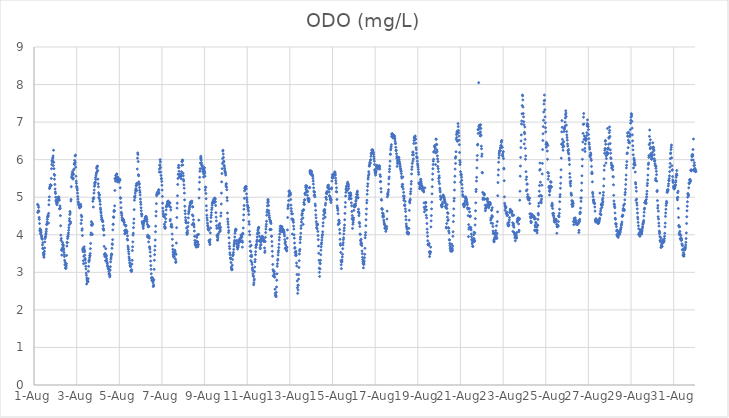
| Category | ODO (mg/L) |
|---|---|
| 44774.166666666664 | 4.81 |
| 44774.177083333336 | 4.6 |
| 44774.1875 | 4.6 |
| 44774.197916666664 | 4.78 |
| 44774.208333333336 | 4.64 |
| 44774.21875 | 4.73 |
| 44774.229166666664 | 4.63 |
| 44774.239583333336 | 4.46 |
| 44774.25 | 4.41 |
| 44774.260416666664 | 4.3 |
| 44774.270833333336 | 4.11 |
| 44774.28125 | 4.16 |
| 44774.291666666664 | 4.12 |
| 44774.302083333336 | 4.03 |
| 44774.3125 | 4.09 |
| 44774.322916666664 | 4.12 |
| 44774.333333333336 | 4.06 |
| 44774.34375 | 3.99 |
| 44774.354166666664 | 3.96 |
| 44774.364583333336 | 3.92 |
| 44774.375 | 3.9 |
| 44774.385416666664 | 3.88 |
| 44774.395833333336 | 3.73 |
| 44774.40625 | 3.64 |
| 44774.416666666664 | 3.79 |
| 44774.427083333336 | 3.63 |
| 44774.4375 | 3.52 |
| 44774.447916666664 | 3.47 |
| 44774.458333333336 | 3.44 |
| 44774.46875 | 3.4 |
| 44774.479166666664 | 3.49 |
| 44774.489583333336 | 3.56 |
| 44774.5 | 3.65 |
| 44774.510416666664 | 3.81 |
| 44774.520833333336 | 3.9 |
| 44774.53125 | 3.94 |
| 44774.541666666664 | 3.95 |
| 44774.552083333336 | 4 |
| 44774.5625 | 4.04 |
| 44774.572916666664 | 4.09 |
| 44774.583333333336 | 4.15 |
| 44774.59375 | 4.27 |
| 44774.604166666664 | 4.29 |
| 44774.614583333336 | 4.34 |
| 44774.625 | 4.41 |
| 44774.635416666664 | 4.47 |
| 44774.645833333336 | 4.48 |
| 44774.65625 | 4.52 |
| 44774.666666666664 | 4.5 |
| 44774.677083333336 | 4.31 |
| 44774.6875 | 4.57 |
| 44774.697916666664 | 4.8 |
| 44774.708333333336 | 4.92 |
| 44774.71875 | 5.01 |
| 44774.729166666664 | 5.23 |
| 44774.739583333336 | 5.25 |
| 44774.75 | 5.28 |
| 44774.760416666664 | 5.33 |
| 44774.770833333336 | 5.32 |
| 44774.78125 | 5.31 |
| 44774.791666666664 | 5.32 |
| 44774.802083333336 | 5.32 |
| 44774.8125 | 5.5 |
| 44774.822916666664 | 5.76 |
| 44774.833333333336 | 5.87 |
| 44774.84375 | 5.97 |
| 44774.854166666664 | 5.94 |
| 44774.864583333336 | 5.98 |
| 44774.875 | 6.03 |
| 44774.885416666664 | 6.06 |
| 44774.895833333336 | 6.1 |
| 44774.90625 | 5.84 |
| 44774.916666666664 | 6.25 |
| 44774.927083333336 | 5.93 |
| 44774.9375 | 5.76 |
| 44774.947916666664 | 5.61 |
| 44774.958333333336 | 5.48 |
| 44774.96875 | 5.58 |
| 44774.979166666664 | 5.34 |
| 44774.989583333336 | 5.22 |
| 44775.0 | 5.14 |
| 44775.010416666664 | 5.1 |
| 44775.020833333336 | 5 |
| 44775.03125 | 4.92 |
| 44775.041666666664 | 4.89 |
| 44775.052083333336 | 4.89 |
| 44775.0625 | 4.84 |
| 44775.072916666664 | 4.8 |
| 44775.083333333336 | 4.84 |
| 44775.09375 | 4.86 |
| 44775.104166666664 | 4.9 |
| 44775.114583333336 | 4.97 |
| 44775.125 | 4.95 |
| 44775.135416666664 | 4.94 |
| 44775.145833333336 | 4.99 |
| 44775.15625 | 5.01 |
| 44775.166666666664 | 5 |
| 44775.177083333336 | 4.95 |
| 44775.1875 | 4.92 |
| 44775.197916666664 | 4.69 |
| 44775.208333333336 | 4.7 |
| 44775.21875 | 4.77 |
| 44775.229166666664 | 4.71 |
| 44775.239583333336 | 4.51 |
| 44775.25 | 4.24 |
| 44775.260416666664 | 3.99 |
| 44775.270833333336 | 3.85 |
| 44775.28125 | 3.9 |
| 44775.291666666664 | 3.6 |
| 44775.302083333336 | 3.46 |
| 44775.3125 | 3.58 |
| 44775.322916666664 | 3.64 |
| 44775.333333333336 | 3.8 |
| 44775.34375 | 3.74 |
| 44775.354166666664 | 3.74 |
| 44775.364583333336 | 3.7 |
| 44775.375 | 3.72 |
| 44775.385416666664 | 3.64 |
| 44775.395833333336 | 3.6 |
| 44775.40625 | 3.53 |
| 44775.416666666664 | 3.47 |
| 44775.427083333336 | 3.42 |
| 44775.4375 | 3.32 |
| 44775.447916666664 | 3.2 |
| 44775.458333333336 | 3.27 |
| 44775.46875 | 3.2 |
| 44775.479166666664 | 3.12 |
| 44775.489583333336 | 3.1 |
| 44775.5 | 3.12 |
| 44775.510416666664 | 3.17 |
| 44775.520833333336 | 3.23 |
| 44775.53125 | 3.45 |
| 44775.541666666664 | 3.7 |
| 44775.552083333336 | 3.8 |
| 44775.5625 | 3.79 |
| 44775.572916666664 | 3.9 |
| 44775.583333333336 | 3.95 |
| 44775.59375 | 3.96 |
| 44775.604166666664 | 4 |
| 44775.614583333336 | 4.05 |
| 44775.625 | 4.12 |
| 44775.635416666664 | 4.19 |
| 44775.645833333336 | 4.26 |
| 44775.65625 | 4.37 |
| 44775.666666666664 | 4.43 |
| 44775.677083333336 | 4.54 |
| 44775.6875 | 4.62 |
| 44775.697916666664 | 4.58 |
| 44775.708333333336 | 4.3 |
| 44775.71875 | 4.34 |
| 44775.729166666664 | 4.9 |
| 44775.739583333336 | 4.94 |
| 44775.75 | 5.28 |
| 44775.760416666664 | 5.53 |
| 44775.770833333336 | 5.53 |
| 44775.78125 | 5.62 |
| 44775.791666666664 | 5.58 |
| 44775.802083333336 | 5.68 |
| 44775.8125 | 5.49 |
| 44775.822916666664 | 5.64 |
| 44775.833333333336 | 5.51 |
| 44775.84375 | 5.49 |
| 44775.854166666664 | 5.61 |
| 44775.864583333336 | 5.73 |
| 44775.875 | 5.75 |
| 44775.885416666664 | 5.88 |
| 44775.895833333336 | 5.9 |
| 44775.90625 | 5.98 |
| 44775.916666666664 | 5.87 |
| 44775.927083333336 | 6.1 |
| 44775.9375 | 5.93 |
| 44775.947916666664 | 6.12 |
| 44775.958333333336 | 5.8 |
| 44775.96875 | 5.56 |
| 44775.979166666664 | 5.43 |
| 44775.989583333336 | 5.37 |
| 44776.0 | 5.29 |
| 44776.010416666664 | 5.26 |
| 44776.020833333336 | 5.23 |
| 44776.03125 | 5.19 |
| 44776.041666666664 | 5.11 |
| 44776.052083333336 | 5.02 |
| 44776.0625 | 4.95 |
| 44776.072916666664 | 4.88 |
| 44776.083333333336 | 4.85 |
| 44776.09375 | 4.81 |
| 44776.104166666664 | 4.8 |
| 44776.114583333336 | 4.78 |
| 44776.125 | 4.74 |
| 44776.135416666664 | 4.72 |
| 44776.145833333336 | 4.72 |
| 44776.15625 | 4.73 |
| 44776.166666666664 | 4.76 |
| 44776.177083333336 | 4.78 |
| 44776.1875 | 4.81 |
| 44776.197916666664 | 4.75 |
| 44776.208333333336 | 4.3 |
| 44776.21875 | 4.52 |
| 44776.229166666664 | 4.39 |
| 44776.239583333336 | 4.48 |
| 44776.25 | 4.12 |
| 44776.260416666664 | 4.16 |
| 44776.270833333336 | 3.98 |
| 44776.28125 | 3.6 |
| 44776.291666666664 | 3.64 |
| 44776.302083333336 | 3.55 |
| 44776.3125 | 3.31 |
| 44776.322916666664 | 3.23 |
| 44776.333333333336 | 3.43 |
| 44776.34375 | 3.63 |
| 44776.354166666664 | 3.68 |
| 44776.364583333336 | 3.59 |
| 44776.375 | 3.55 |
| 44776.385416666664 | 3.46 |
| 44776.395833333336 | 3.37 |
| 44776.40625 | 3.33 |
| 44776.416666666664 | 3.25 |
| 44776.427083333336 | 3.16 |
| 44776.4375 | 3.09 |
| 44776.447916666664 | 2.98 |
| 44776.458333333336 | 2.92 |
| 44776.46875 | 2.69 |
| 44776.479166666664 | 2.85 |
| 44776.489583333336 | 2.81 |
| 44776.5 | 2.78 |
| 44776.510416666664 | 2.75 |
| 44776.520833333336 | 2.75 |
| 44776.53125 | 2.75 |
| 44776.541666666664 | 2.83 |
| 44776.552083333336 | 3.03 |
| 44776.5625 | 3.16 |
| 44776.572916666664 | 3.28 |
| 44776.583333333336 | 3.31 |
| 44776.59375 | 3.33 |
| 44776.604166666664 | 3.39 |
| 44776.614583333336 | 3.45 |
| 44776.625 | 3.44 |
| 44776.635416666664 | 3.5 |
| 44776.645833333336 | 3.63 |
| 44776.65625 | 3.77 |
| 44776.666666666664 | 4 |
| 44776.677083333336 | 4.05 |
| 44776.6875 | 4.35 |
| 44776.697916666664 | 4.26 |
| 44776.708333333336 | 4.28 |
| 44776.71875 | 4.25 |
| 44776.729166666664 | 4.31 |
| 44776.739583333336 | 4.01 |
| 44776.75 | 4.28 |
| 44776.760416666664 | 4.89 |
| 44776.770833333336 | 4.96 |
| 44776.78125 | 4.74 |
| 44776.791666666664 | 4.96 |
| 44776.802083333336 | 4.99 |
| 44776.8125 | 5.11 |
| 44776.822916666664 | 5.19 |
| 44776.833333333336 | 5.29 |
| 44776.84375 | 5.38 |
| 44776.854166666664 | 5.33 |
| 44776.864583333336 | 5.39 |
| 44776.875 | 5.4 |
| 44776.885416666664 | 5.52 |
| 44776.895833333336 | 5.47 |
| 44776.90625 | 5.57 |
| 44776.916666666664 | 5.62 |
| 44776.927083333336 | 5.65 |
| 44776.9375 | 5.77 |
| 44776.947916666664 | 5.8 |
| 44776.958333333336 | 5.81 |
| 44776.96875 | 5.69 |
| 44776.979166666664 | 5.83 |
| 44776.989583333336 | 5.71 |
| 44777.0 | 5.48 |
| 44777.010416666664 | 5.36 |
| 44777.020833333336 | 5.28 |
| 44777.03125 | 5.12 |
| 44777.041666666664 | 4.99 |
| 44777.052083333336 | 4.98 |
| 44777.0625 | 5.07 |
| 44777.072916666664 | 5.06 |
| 44777.083333333336 | 4.93 |
| 44777.09375 | 4.89 |
| 44777.104166666664 | 4.81 |
| 44777.114583333336 | 4.71 |
| 44777.125 | 4.67 |
| 44777.135416666664 | 4.61 |
| 44777.145833333336 | 4.58 |
| 44777.15625 | 4.51 |
| 44777.166666666664 | 4.46 |
| 44777.177083333336 | 4.41 |
| 44777.1875 | 4.41 |
| 44777.197916666664 | 4.38 |
| 44777.208333333336 | 4.36 |
| 44777.21875 | 4.36 |
| 44777.229166666664 | 4.35 |
| 44777.239583333336 | 4.16 |
| 44777.25 | 4.24 |
| 44777.260416666664 | 4.16 |
| 44777.270833333336 | 4.12 |
| 44777.28125 | 3.99 |
| 44777.291666666664 | 3.69 |
| 44777.302083333336 | 3.47 |
| 44777.3125 | 3.48 |
| 44777.322916666664 | 3.42 |
| 44777.333333333336 | 3.5 |
| 44777.34375 | 3.49 |
| 44777.354166666664 | 3.31 |
| 44777.364583333336 | 3.63 |
| 44777.375 | 3.43 |
| 44777.385416666664 | 3.42 |
| 44777.395833333336 | 3.45 |
| 44777.40625 | 3.36 |
| 44777.416666666664 | 3.3 |
| 44777.427083333336 | 3.26 |
| 44777.4375 | 3.23 |
| 44777.447916666664 | 3.18 |
| 44777.458333333336 | 3.16 |
| 44777.46875 | 3.14 |
| 44777.479166666664 | 3.09 |
| 44777.489583333336 | 3.1 |
| 44777.5 | 3.09 |
| 44777.510416666664 | 3.02 |
| 44777.520833333336 | 2.95 |
| 44777.53125 | 2.96 |
| 44777.541666666664 | 2.96 |
| 44777.552083333336 | 2.88 |
| 44777.5625 | 2.91 |
| 44777.572916666664 | 3.06 |
| 44777.583333333336 | 3.15 |
| 44777.59375 | 3.28 |
| 44777.604166666664 | 3.35 |
| 44777.614583333336 | 3.39 |
| 44777.625 | 3.44 |
| 44777.635416666664 | 3.49 |
| 44777.645833333336 | 3.48 |
| 44777.65625 | 3.64 |
| 44777.666666666664 | 3.76 |
| 44777.677083333336 | 3.74 |
| 44777.6875 | 3.87 |
| 44777.697916666664 | 4.13 |
| 44777.708333333336 | 4.28 |
| 44777.71875 | 4.28 |
| 44777.729166666664 | 4.48 |
| 44777.739583333336 | 4.46 |
| 44777.75 | 4.62 |
| 44777.760416666664 | 4.65 |
| 44777.770833333336 | 4.63 |
| 44777.78125 | 4.77 |
| 44777.791666666664 | 5.18 |
| 44777.802083333336 | 5.49 |
| 44777.8125 | 5.5 |
| 44777.822916666664 | 5.43 |
| 44777.833333333336 | 5.58 |
| 44777.84375 | 5.5 |
| 44777.854166666664 | 5.53 |
| 44777.864583333336 | 5.56 |
| 44777.875 | 5.61 |
| 44777.885416666664 | 5.62 |
| 44777.895833333336 | 5.49 |
| 44777.90625 | 5.43 |
| 44777.916666666664 | 5.41 |
| 44777.927083333336 | 5.5 |
| 44777.9375 | 5.53 |
| 44777.947916666664 | 5.49 |
| 44777.958333333336 | 5.47 |
| 44777.96875 | 5.44 |
| 44777.979166666664 | 5.44 |
| 44777.989583333336 | 5.4 |
| 44778.0 | 5.45 |
| 44778.010416666664 | 5.47 |
| 44778.020833333336 | 5.48 |
| 44778.03125 | 5.45 |
| 44778.041666666664 | 5.25 |
| 44778.052083333336 | 4.99 |
| 44778.0625 | 4.97 |
| 44778.072916666664 | 4.86 |
| 44778.083333333336 | 4.72 |
| 44778.09375 | 4.6 |
| 44778.104166666664 | 4.57 |
| 44778.114583333336 | 4.52 |
| 44778.125 | 4.46 |
| 44778.135416666664 | 4.4 |
| 44778.145833333336 | 4.39 |
| 44778.15625 | 4.38 |
| 44778.166666666664 | 4.39 |
| 44778.177083333336 | 4.41 |
| 44778.1875 | 4.41 |
| 44778.197916666664 | 4.38 |
| 44778.208333333336 | 4.39 |
| 44778.21875 | 4.35 |
| 44778.229166666664 | 4.32 |
| 44778.239583333336 | 4.27 |
| 44778.25 | 4.11 |
| 44778.260416666664 | 4.03 |
| 44778.270833333336 | 4.03 |
| 44778.28125 | 4.08 |
| 44778.291666666664 | 4.12 |
| 44778.302083333336 | 4.23 |
| 44778.3125 | 4.25 |
| 44778.322916666664 | 4.13 |
| 44778.333333333336 | 4.07 |
| 44778.34375 | 4.08 |
| 44778.354166666664 | 4.05 |
| 44778.364583333336 | 4.09 |
| 44778.375 | 3.88 |
| 44778.385416666664 | 3.97 |
| 44778.395833333336 | 3.86 |
| 44778.40625 | 3.7 |
| 44778.416666666664 | 3.65 |
| 44778.427083333336 | 3.61 |
| 44778.4375 | 3.55 |
| 44778.447916666664 | 3.49 |
| 44778.458333333336 | 3.41 |
| 44778.46875 | 3.37 |
| 44778.479166666664 | 3.32 |
| 44778.489583333336 | 3.26 |
| 44778.5 | 3.23 |
| 44778.510416666664 | 3.18 |
| 44778.520833333336 | 3.16 |
| 44778.53125 | 3.15 |
| 44778.541666666664 | 3.05 |
| 44778.552083333336 | 3.04 |
| 44778.5625 | 3.04 |
| 44778.572916666664 | 3.02 |
| 44778.583333333336 | 3.07 |
| 44778.59375 | 3.22 |
| 44778.604166666664 | 3.32 |
| 44778.614583333336 | 3.58 |
| 44778.625 | 3.68 |
| 44778.635416666664 | 3.81 |
| 44778.645833333336 | 3.99 |
| 44778.65625 | 4.04 |
| 44778.666666666664 | 4.19 |
| 44778.677083333336 | 4.31 |
| 44778.6875 | 4.42 |
| 44778.697916666664 | 4.67 |
| 44778.708333333336 | 4.92 |
| 44778.71875 | 5.01 |
| 44778.729166666664 | 4.99 |
| 44778.739583333336 | 5.04 |
| 44778.75 | 5.11 |
| 44778.760416666664 | 5.17 |
| 44778.770833333336 | 5.19 |
| 44778.78125 | 5.23 |
| 44778.791666666664 | 5.31 |
| 44778.802083333336 | 5.31 |
| 44778.8125 | 5.36 |
| 44778.822916666664 | 5.18 |
| 44778.833333333336 | 5.37 |
| 44778.84375 | 5.75 |
| 44778.854166666664 | 6.04 |
| 44778.864583333336 | 6.18 |
| 44778.875 | 6.14 |
| 44778.885416666664 | 5.95 |
| 44778.895833333336 | 5.6 |
| 44778.90625 | 5.57 |
| 44778.916666666664 | 5.41 |
| 44778.927083333336 | 5.34 |
| 44778.9375 | 5.36 |
| 44778.947916666664 | 5.26 |
| 44778.958333333336 | 5.18 |
| 44778.96875 | 5.13 |
| 44778.979166666664 | 5.06 |
| 44778.989583333336 | 4.95 |
| 44779.0 | 4.87 |
| 44779.010416666664 | 4.81 |
| 44779.020833333336 | 4.72 |
| 44779.03125 | 4.64 |
| 44779.041666666664 | 4.56 |
| 44779.052083333336 | 4.5 |
| 44779.0625 | 4.54 |
| 44779.072916666664 | 4.35 |
| 44779.083333333336 | 4.32 |
| 44779.09375 | 4.3 |
| 44779.104166666664 | 4.27 |
| 44779.114583333336 | 4.21 |
| 44779.125 | 4.17 |
| 44779.135416666664 | 4.25 |
| 44779.145833333336 | 4.31 |
| 44779.15625 | 4.34 |
| 44779.166666666664 | 4.36 |
| 44779.177083333336 | 4.37 |
| 44779.1875 | 4.37 |
| 44779.197916666664 | 4.39 |
| 44779.208333333336 | 4.43 |
| 44779.21875 | 4.43 |
| 44779.229166666664 | 4.47 |
| 44779.239583333336 | 4.47 |
| 44779.25 | 4.49 |
| 44779.260416666664 | 4.49 |
| 44779.270833333336 | 4.46 |
| 44779.28125 | 4.41 |
| 44779.291666666664 | 4.41 |
| 44779.302083333336 | 4.35 |
| 44779.3125 | 4.28 |
| 44779.322916666664 | 3.94 |
| 44779.333333333336 | 3.99 |
| 44779.34375 | 3.97 |
| 44779.354166666664 | 4.21 |
| 44779.364583333336 | 4.24 |
| 44779.375 | 3.81 |
| 44779.385416666664 | 4.22 |
| 44779.395833333336 | 3.95 |
| 44779.40625 | 3.91 |
| 44779.416666666664 | 3.66 |
| 44779.427083333336 | 3.68 |
| 44779.4375 | 3.62 |
| 44779.447916666664 | 3.54 |
| 44779.458333333336 | 3.43 |
| 44779.46875 | 3.3 |
| 44779.479166666664 | 3.18 |
| 44779.489583333336 | 3.08 |
| 44779.5 | 2.96 |
| 44779.510416666664 | 2.86 |
| 44779.520833333336 | 2.83 |
| 44779.53125 | 2.79 |
| 44779.541666666664 | 2.79 |
| 44779.552083333336 | 2.85 |
| 44779.5625 | 2.85 |
| 44779.572916666664 | 2.76 |
| 44779.583333333336 | 2.72 |
| 44779.59375 | 2.62 |
| 44779.604166666664 | 2.64 |
| 44779.614583333336 | 2.66 |
| 44779.625 | 2.8 |
| 44779.635416666664 | 3.08 |
| 44779.645833333336 | 3.32 |
| 44779.65625 | 3.47 |
| 44779.666666666664 | 3.59 |
| 44779.677083333336 | 3.7 |
| 44779.6875 | 3.86 |
| 44779.697916666664 | 4.08 |
| 44779.708333333336 | 4.23 |
| 44779.71875 | 4.5 |
| 44779.729166666664 | 4.62 |
| 44779.739583333336 | 4.83 |
| 44779.75 | 5.04 |
| 44779.760416666664 | 5.08 |
| 44779.770833333336 | 5.11 |
| 44779.78125 | 5.09 |
| 44779.791666666664 | 5.09 |
| 44779.802083333336 | 5.14 |
| 44779.8125 | 5.1 |
| 44779.822916666664 | 5.09 |
| 44779.833333333336 | 5.14 |
| 44779.84375 | 5.19 |
| 44779.854166666664 | 5.2 |
| 44779.864583333336 | 5.11 |
| 44779.875 | 5.67 |
| 44779.885416666664 | 5.75 |
| 44779.895833333336 | 5.85 |
| 44779.90625 | 5.86 |
| 44779.916666666664 | 6 |
| 44779.927083333336 | 5.94 |
| 44779.9375 | 5.79 |
| 44779.947916666664 | 5.67 |
| 44779.958333333336 | 5.58 |
| 44779.96875 | 5.49 |
| 44779.979166666664 | 5.5 |
| 44779.989583333336 | 5.42 |
| 44780.0 | 5.32 |
| 44780.010416666664 | 5.19 |
| 44780.020833333336 | 5.02 |
| 44780.03125 | 4.84 |
| 44780.041666666664 | 4.71 |
| 44780.052083333336 | 4.63 |
| 44780.0625 | 4.57 |
| 44780.072916666664 | 4.53 |
| 44780.083333333336 | 4.49 |
| 44780.09375 | 4.49 |
| 44780.104166666664 | 4.48 |
| 44780.114583333336 | 4.28 |
| 44780.125 | 4.21 |
| 44780.135416666664 | 4.22 |
| 44780.145833333336 | 4.17 |
| 44780.15625 | 4.19 |
| 44780.166666666664 | 4.34 |
| 44780.177083333336 | 4.43 |
| 44780.1875 | 4.54 |
| 44780.197916666664 | 4.66 |
| 44780.208333333336 | 4.74 |
| 44780.21875 | 4.76 |
| 44780.229166666664 | 4.77 |
| 44780.239583333336 | 4.8 |
| 44780.25 | 4.82 |
| 44780.260416666664 | 4.86 |
| 44780.270833333336 | 4.88 |
| 44780.28125 | 4.89 |
| 44780.291666666664 | 4.9 |
| 44780.302083333336 | 4.88 |
| 44780.3125 | 4.87 |
| 44780.322916666664 | 4.82 |
| 44780.333333333336 | 4.79 |
| 44780.34375 | 4.76 |
| 44780.354166666664 | 4.84 |
| 44780.364583333336 | 4.85 |
| 44780.375 | 4.85 |
| 44780.385416666664 | 4.37 |
| 44780.395833333336 | 4.41 |
| 44780.40625 | 4.73 |
| 44780.416666666664 | 4.66 |
| 44780.427083333336 | 4.22 |
| 44780.4375 | 4.26 |
| 44780.447916666664 | 4.28 |
| 44780.458333333336 | 4.22 |
| 44780.46875 | 4.2 |
| 44780.479166666664 | 4.02 |
| 44780.489583333336 | 3.88 |
| 44780.5 | 3.71 |
| 44780.510416666664 | 3.61 |
| 44780.520833333336 | 3.54 |
| 44780.53125 | 3.48 |
| 44780.541666666664 | 3.44 |
| 44780.552083333336 | 3.42 |
| 44780.5625 | 3.4 |
| 44780.572916666664 | 3.41 |
| 44780.583333333336 | 3.47 |
| 44780.59375 | 3.51 |
| 44780.604166666664 | 3.59 |
| 44780.614583333336 | 3.56 |
| 44780.625 | 3.51 |
| 44780.635416666664 | 3.35 |
| 44780.645833333336 | 3.26 |
| 44780.65625 | 3.29 |
| 44780.666666666664 | 3.48 |
| 44780.677083333336 | 3.78 |
| 44780.6875 | 4.19 |
| 44780.697916666664 | 4.46 |
| 44780.708333333336 | 4.71 |
| 44780.71875 | 4.84 |
| 44780.729166666664 | 5.04 |
| 44780.739583333336 | 5.34 |
| 44780.75 | 5.5 |
| 44780.760416666664 | 5.61 |
| 44780.770833333336 | 5.79 |
| 44780.78125 | 5.85 |
| 44780.791666666664 | 5.79 |
| 44780.802083333336 | 5.69 |
| 44780.8125 | 5.61 |
| 44780.822916666664 | 5.55 |
| 44780.833333333336 | 5.55 |
| 44780.84375 | 5.54 |
| 44780.854166666664 | 5.57 |
| 44780.864583333336 | 5.57 |
| 44780.875 | 5.55 |
| 44780.885416666664 | 5.56 |
| 44780.895833333336 | 5.61 |
| 44780.90625 | 5.49 |
| 44780.916666666664 | 5.68 |
| 44780.927083333336 | 5.85 |
| 44780.9375 | 5.95 |
| 44780.947916666664 | 5.95 |
| 44780.958333333336 | 5.99 |
| 44780.96875 | 5.98 |
| 44780.979166666664 | 5.86 |
| 44780.989583333336 | 5.64 |
| 44781.0 | 5.57 |
| 44781.010416666664 | 5.47 |
| 44781.020833333336 | 5.43 |
| 44781.03125 | 5.33 |
| 44781.041666666664 | 5.24 |
| 44781.052083333336 | 5.11 |
| 44781.0625 | 4.93 |
| 44781.072916666664 | 4.76 |
| 44781.083333333336 | 4.64 |
| 44781.09375 | 4.56 |
| 44781.104166666664 | 4.46 |
| 44781.114583333336 | 4.39 |
| 44781.125 | 4.34 |
| 44781.135416666664 | 4.32 |
| 44781.145833333336 | 4.32 |
| 44781.15625 | 4.18 |
| 44781.166666666664 | 4.06 |
| 44781.177083333336 | 4.01 |
| 44781.1875 | 4.04 |
| 44781.197916666664 | 4.04 |
| 44781.208333333336 | 4.11 |
| 44781.21875 | 4.22 |
| 44781.229166666664 | 4.32 |
| 44781.239583333336 | 4.45 |
| 44781.25 | 4.56 |
| 44781.260416666664 | 4.61 |
| 44781.270833333336 | 4.63 |
| 44781.28125 | 4.68 |
| 44781.291666666664 | 4.72 |
| 44781.302083333336 | 4.76 |
| 44781.3125 | 4.78 |
| 44781.322916666664 | 4.83 |
| 44781.333333333336 | 4.86 |
| 44781.34375 | 4.86 |
| 44781.354166666664 | 4.88 |
| 44781.364583333336 | 4.86 |
| 44781.375 | 4.84 |
| 44781.385416666664 | 4.85 |
| 44781.395833333336 | 4.86 |
| 44781.40625 | 4.9 |
| 44781.416666666664 | 4.27 |
| 44781.427083333336 | 4.53 |
| 44781.4375 | 4.75 |
| 44781.447916666664 | 4.74 |
| 44781.458333333336 | 4.5 |
| 44781.46875 | 4.31 |
| 44781.479166666664 | 4.4 |
| 44781.489583333336 | 4.26 |
| 44781.5 | 4.28 |
| 44781.510416666664 | 4.21 |
| 44781.520833333336 | 4.1 |
| 44781.53125 | 3.96 |
| 44781.541666666664 | 3.85 |
| 44781.55210648148 | 3.78 |
| 44781.5625 | 3.73 |
| 44781.572916666664 | 3.79 |
| 44781.583333333336 | 3.73 |
| 44781.59375 | 3.71 |
| 44781.604166666664 | 3.67 |
| 44781.614583333336 | 3.73 |
| 44781.625 | 3.83 |
| 44781.635416666664 | 3.93 |
| 44781.645833333336 | 3.98 |
| 44781.65625 | 4 |
| 44781.666666666664 | 3.81 |
| 44781.677083333336 | 3.81 |
| 44781.6875 | 3.68 |
| 44781.697916666664 | 3.74 |
| 44781.708333333336 | 3.74 |
| 44781.71875 | 4.01 |
| 44781.729166666664 | 4.39 |
| 44781.739583333336 | 4.98 |
| 44781.75 | 5.21 |
| 44781.760416666664 | 5.4 |
| 44781.770833333336 | 5.53 |
| 44781.78125 | 5.69 |
| 44781.791666666664 | 5.76 |
| 44781.802083333336 | 5.91 |
| 44781.8125 | 6.03 |
| 44781.822916666664 | 6.09 |
| 44781.833333333336 | 6.05 |
| 44781.84375 | 5.99 |
| 44781.854166666664 | 5.92 |
| 44781.864583333336 | 5.87 |
| 44781.875 | 5.85 |
| 44781.885416666664 | 5.84 |
| 44781.895833333336 | 5.81 |
| 44781.90625 | 5.76 |
| 44781.916666666664 | 5.73 |
| 44781.927083333336 | 5.69 |
| 44781.9375 | 5.67 |
| 44781.947916666664 | 5.54 |
| 44781.958333333336 | 5.62 |
| 44781.96875 | 5.73 |
| 44781.979166666664 | 5.77 |
| 44781.989583333336 | 5.79 |
| 44782.0 | 5.69 |
| 44782.010416666664 | 5.64 |
| 44782.020833333336 | 5.56 |
| 44782.03125 | 5.19 |
| 44782.041666666664 | 5.27 |
| 44782.052083333336 | 5.26 |
| 44782.0625 | 5.1 |
| 44782.072916666664 | 4.96 |
| 44782.083333333336 | 4.77 |
| 44782.09375 | 4.65 |
| 44782.104166666664 | 4.52 |
| 44782.114583333336 | 4.45 |
| 44782.125 | 4.39 |
| 44782.135416666664 | 4.31 |
| 44782.145833333336 | 4.25 |
| 44782.15625 | 4.22 |
| 44782.166666666664 | 4.17 |
| 44782.177083333336 | 4.14 |
| 44782.1875 | 4.15 |
| 44782.197916666664 | 4.12 |
| 44782.208333333336 | 3.85 |
| 44782.21875 | 3.83 |
| 44782.229166666664 | 3.81 |
| 44782.239583333336 | 3.79 |
| 44782.25 | 3.74 |
| 44782.260416666664 | 3.87 |
| 44782.270833333336 | 4.05 |
| 44782.28125 | 4.18 |
| 44782.291666666664 | 4.35 |
| 44782.302083333336 | 4.46 |
| 44782.3125 | 4.52 |
| 44782.322916666664 | 4.59 |
| 44782.333333333336 | 4.67 |
| 44782.34375 | 4.72 |
| 44782.354166666664 | 4.79 |
| 44782.364583333336 | 4.84 |
| 44782.375 | 4.85 |
| 44782.385416666664 | 4.87 |
| 44782.395833333336 | 4.89 |
| 44782.40625 | 4.85 |
| 44782.416666666664 | 4.91 |
| 44782.427083333336 | 4.95 |
| 44782.4375 | 4.89 |
| 44782.447916666664 | 4.85 |
| 44782.458333333336 | 4.94 |
| 44782.46875 | 4.87 |
| 44782.479166666664 | 4.98 |
| 44782.489583333336 | 4.96 |
| 44782.5 | 4.95 |
| 44782.510416666664 | 4.88 |
| 44782.520833333336 | 4.78 |
| 44782.53125 | 4.59 |
| 44782.541666666664 | 4.47 |
| 44782.552083333336 | 4.37 |
| 44782.5625 | 4.24 |
| 44782.572916666664 | 4.17 |
| 44782.583333333336 | 3.99 |
| 44782.59375 | 3.95 |
| 44782.604166666664 | 3.86 |
| 44782.614583333336 | 3.86 |
| 44782.625 | 3.92 |
| 44782.635416666664 | 3.99 |
| 44782.645833333336 | 4.03 |
| 44782.65625 | 4.18 |
| 44782.666666666664 | 4.19 |
| 44782.677083333336 | 4.27 |
| 44782.6875 | 4.25 |
| 44782.697916666664 | 4.08 |
| 44782.708333333336 | 4.3 |
| 44782.71875 | 4.18 |
| 44782.729166666664 | 4.14 |
| 44782.739583333336 | 4.1 |
| 44782.75 | 4.2 |
| 44782.760416666664 | 4.5 |
| 44782.770833333336 | 4.58 |
| 44782.78125 | 4.82 |
| 44782.791666666664 | 5.11 |
| 44782.802083333336 | 5.41 |
| 44782.8125 | 5.63 |
| 44782.822916666664 | 5.76 |
| 44782.833333333336 | 5.9 |
| 44782.84375 | 6.03 |
| 44782.854166666664 | 6.23 |
| 44782.864583333336 | 6.25 |
| 44782.875 | 6.15 |
| 44782.885416666664 | 6.06 |
| 44782.895833333336 | 5.96 |
| 44782.90625 | 5.94 |
| 44782.916666666664 | 5.85 |
| 44782.927083333336 | 5.82 |
| 44782.9375 | 5.77 |
| 44782.947916666664 | 5.72 |
| 44782.958333333336 | 5.68 |
| 44782.96875 | 5.67 |
| 44782.979166666664 | 5.64 |
| 44782.989583333336 | 5.59 |
| 44783.0 | 5.3 |
| 44783.010416666664 | 5.35 |
| 44783.020833333336 | 5.36 |
| 44783.03125 | 5.27 |
| 44783.041666666664 | 5.2 |
| 44783.052083333336 | 4.99 |
| 44783.0625 | 4.91 |
| 44783.072916666664 | 4.58 |
| 44783.083333333336 | 4.42 |
| 44783.09375 | 4.35 |
| 44783.104166666664 | 4.28 |
| 44783.114583333336 | 4.2 |
| 44783.125 | 4.06 |
| 44783.135416666664 | 4.11 |
| 44783.145833333336 | 3.92 |
| 44783.15625 | 3.78 |
| 44783.166666666664 | 3.69 |
| 44783.177083333336 | 3.63 |
| 44783.1875 | 3.52 |
| 44783.197916666664 | 3.47 |
| 44783.208333333336 | 3.38 |
| 44783.21875 | 3.38 |
| 44783.229166666664 | 3.36 |
| 44783.239583333336 | 3.26 |
| 44783.25 | 3.14 |
| 44783.260416666664 | 3.1 |
| 44783.270833333336 | 3.07 |
| 44783.28125 | 3.09 |
| 44783.291666666664 | 3.07 |
| 44783.302083333336 | 3.19 |
| 44783.3125 | 3.34 |
| 44783.322916666664 | 3.44 |
| 44783.333333333336 | 3.46 |
| 44783.34375 | 3.48 |
| 44783.354166666664 | 3.53 |
| 44783.364583333336 | 3.61 |
| 44783.375 | 3.7 |
| 44783.385416666664 | 3.75 |
| 44783.395833333336 | 3.8 |
| 44783.40625 | 3.85 |
| 44783.416666666664 | 3.94 |
| 44783.427083333336 | 4.04 |
| 44783.4375 | 4.1 |
| 44783.447916666664 | 4.11 |
| 44783.458333333336 | 4.15 |
| 44783.46875 | 4.14 |
| 44783.479166666664 | 4.13 |
| 44783.489583333336 | 3.83 |
| 44783.5 | 3.76 |
| 44783.510416666664 | 3.85 |
| 44783.520833333336 | 3.76 |
| 44783.53125 | 3.69 |
| 44783.541666666664 | 3.66 |
| 44783.552083333336 | 3.62 |
| 44783.5625 | 3.66 |
| 44783.572916666664 | 3.68 |
| 44783.583333333336 | 3.72 |
| 44783.59375 | 3.77 |
| 44783.604166666664 | 3.8 |
| 44783.614583333336 | 3.84 |
| 44783.625 | 3.86 |
| 44783.635416666664 | 3.88 |
| 44783.645833333336 | 3.82 |
| 44783.65625 | 3.85 |
| 44783.666666666664 | 3.85 |
| 44783.677083333336 | 3.82 |
| 44783.6875 | 3.9 |
| 44783.697916666664 | 3.92 |
| 44783.708333333336 | 3.97 |
| 44783.71875 | 4 |
| 44783.729166666664 | 3.93 |
| 44783.739583333336 | 3.97 |
| 44783.75 | 3.94 |
| 44783.760416666664 | 3.84 |
| 44783.770833333336 | 3.67 |
| 44783.78125 | 3.8 |
| 44783.791666666664 | 4.04 |
| 44783.802083333336 | 4.02 |
| 44783.8125 | 4.18 |
| 44783.822916666664 | 4.39 |
| 44783.833333333336 | 4.53 |
| 44783.84375 | 4.68 |
| 44783.854166666664 | 4.78 |
| 44783.864583333336 | 4.97 |
| 44783.875 | 5.17 |
| 44783.885416666664 | 5.23 |
| 44783.895833333336 | 5.26 |
| 44783.90625 | 5.23 |
| 44783.916666666664 | 5.28 |
| 44783.927083333336 | 5.26 |
| 44783.9375 | 5.29 |
| 44783.947916666664 | 5.28 |
| 44783.958333333336 | 5.22 |
| 44783.96875 | 5.09 |
| 44783.979166666664 | 4.99 |
| 44783.989583333336 | 4.93 |
| 44784.0 | 4.87 |
| 44784.010416666664 | 4.79 |
| 44784.020833333336 | 4.76 |
| 44784.03125 | 4.68 |
| 44784.041666666664 | 4.73 |
| 44784.052083333336 | 4.72 |
| 44784.0625 | 4.63 |
| 44784.072916666664 | 4.54 |
| 44784.083333333336 | 4.35 |
| 44784.09375 | 4.28 |
| 44784.104166666664 | 4.09 |
| 44784.114583333336 | 4 |
| 44784.125 | 3.82 |
| 44784.135416666664 | 3.69 |
| 44784.145833333336 | 3.57 |
| 44784.15625 | 3.43 |
| 44784.166666666664 | 3.31 |
| 44784.177083333336 | 3.55 |
| 44784.1875 | 3.72 |
| 44784.197916666664 | 3.46 |
| 44784.208333333336 | 3.42 |
| 44784.21875 | 3.26 |
| 44784.229166666664 | 3.21 |
| 44784.239583333336 | 3.12 |
| 44784.25 | 3.08 |
| 44784.260416666664 | 3.04 |
| 44784.270833333336 | 2.96 |
| 44784.28125 | 2.91 |
| 44784.291666666664 | 2.89 |
| 44784.302083333336 | 2.67 |
| 44784.3125 | 2.72 |
| 44784.322916666664 | 2.79 |
| 44784.333333333336 | 2.82 |
| 44784.34375 | 3.02 |
| 44784.354166666664 | 3.14 |
| 44784.364583333336 | 3.28 |
| 44784.375 | 3.34 |
| 44784.385416666664 | 3.47 |
| 44784.395833333336 | 3.55 |
| 44784.40625 | 3.66 |
| 44784.416666666664 | 3.71 |
| 44784.427083333336 | 3.73 |
| 44784.4375 | 3.75 |
| 44784.447916666664 | 3.82 |
| 44784.458333333336 | 3.86 |
| 44784.46875 | 3.94 |
| 44784.479166666664 | 4.02 |
| 44784.489583333336 | 4.05 |
| 44784.5 | 4.11 |
| 44784.510416666664 | 4.15 |
| 44784.520833333336 | 4.18 |
| 44784.53125 | 4.18 |
| 44784.541666666664 | 4.2 |
| 44784.552083333336 | 4.05 |
| 44784.5625 | 3.83 |
| 44784.572916666664 | 3.96 |
| 44784.583333333336 | 3.84 |
| 44784.59375 | 3.86 |
| 44784.604166666664 | 3.66 |
| 44784.614583333336 | 3.63 |
| 44784.625 | 3.72 |
| 44784.635416666664 | 3.81 |
| 44784.645833333336 | 3.74 |
| 44784.65625 | 3.87 |
| 44784.666666666664 | 3.91 |
| 44784.677083333336 | 3.92 |
| 44784.6875 | 3.9 |
| 44784.697916666664 | 3.94 |
| 44784.708333333336 | 3.96 |
| 44784.71875 | 3.94 |
| 44784.729166666664 | 3.9 |
| 44784.739583333336 | 3.84 |
| 44784.75 | 3.89 |
| 44784.760416666664 | 3.85 |
| 44784.770833333336 | 3.83 |
| 44784.78125 | 3.86 |
| 44784.791666666664 | 3.82 |
| 44784.802083333336 | 3.83 |
| 44784.8125 | 3.65 |
| 44784.822916666664 | 3.53 |
| 44784.833333333336 | 3.57 |
| 44784.84375 | 3.82 |
| 44784.854166666664 | 3.93 |
| 44784.864583333336 | 4.06 |
| 44784.875 | 4.15 |
| 44784.885416666664 | 4.22 |
| 44784.895833333336 | 4.28 |
| 44784.90625 | 4.36 |
| 44784.916666666664 | 4.52 |
| 44784.927083333336 | 4.6 |
| 44784.9375 | 4.66 |
| 44784.947916666664 | 4.77 |
| 44784.958333333336 | 4.85 |
| 44784.96875 | 4.92 |
| 44784.979166666664 | 4.94 |
| 44784.989583333336 | 4.88 |
| 44785.0 | 4.78 |
| 44785.010416666664 | 4.64 |
| 44785.020833333336 | 4.57 |
| 44785.03125 | 4.51 |
| 44785.041666666664 | 4.46 |
| 44785.052083333336 | 4.41 |
| 44785.0625 | 4.13 |
| 44785.072916666664 | 4.15 |
| 44785.083333333336 | 4.35 |
| 44785.09375 | 4.37 |
| 44785.104166666664 | 4.34 |
| 44785.114583333336 | 4.3 |
| 44785.125 | 4.14 |
| 44785.135416666664 | 3.96 |
| 44785.145833333336 | 3.96 |
| 44785.15625 | 3.82 |
| 44785.166666666664 | 3.7 |
| 44785.177083333336 | 3.56 |
| 44785.1875 | 3.43 |
| 44785.197916666664 | 3.21 |
| 44785.208333333336 | 3.07 |
| 44785.21875 | 2.91 |
| 44785.229166666664 | 2.9 |
| 44785.239583333336 | 3.03 |
| 44785.25 | 3.02 |
| 44785.260416666664 | 3.03 |
| 44785.270833333336 | 2.97 |
| 44785.28125 | 2.94 |
| 44785.291666666664 | 2.87 |
| 44785.302083333336 | 2.55 |
| 44785.3125 | 2.44 |
| 44785.322916666664 | 2.38 |
| 44785.333333333336 | 2.39 |
| 44785.34375 | 2.38 |
| 44785.354166666664 | 2.35 |
| 44785.364583333336 | 2.47 |
| 44785.375 | 2.61 |
| 44785.385416666664 | 2.79 |
| 44785.395833333336 | 2.96 |
| 44785.40625 | 3.16 |
| 44785.416666666664 | 3.23 |
| 44785.427083333336 | 3.32 |
| 44785.4375 | 3.35 |
| 44785.447916666664 | 3.46 |
| 44785.458333333336 | 3.53 |
| 44785.46875 | 3.58 |
| 44785.479166666664 | 3.66 |
| 44785.489583333336 | 3.75 |
| 44785.5 | 3.86 |
| 44785.510416666664 | 3.93 |
| 44785.520833333336 | 4.02 |
| 44785.53125 | 4.1 |
| 44785.541666666664 | 4.16 |
| 44785.552083333336 | 4.22 |
| 44785.5625 | 4.23 |
| 44785.572916666664 | 4.11 |
| 44785.583333333336 | 4.13 |
| 44785.59375 | 4.08 |
| 44785.604166666664 | 4.21 |
| 44785.614583333336 | 4.19 |
| 44785.625 | 4.22 |
| 44785.635416666664 | 4.18 |
| 44785.645833333336 | 4.11 |
| 44785.65625 | 4.15 |
| 44785.666666666664 | 4.08 |
| 44785.677083333336 | 4.1 |
| 44785.6875 | 4.13 |
| 44785.697916666664 | 4.13 |
| 44785.708333333336 | 4.12 |
| 44785.71875 | 4.09 |
| 44785.729166666664 | 4.06 |
| 44785.739583333336 | 4.02 |
| 44785.75 | 3.97 |
| 44785.760416666664 | 3.87 |
| 44785.770833333336 | 3.78 |
| 44785.78125 | 3.64 |
| 44785.791666666664 | 3.81 |
| 44785.802083333336 | 3.73 |
| 44785.8125 | 3.62 |
| 44785.822916666664 | 3.63 |
| 44785.833333333336 | 3.66 |
| 44785.84375 | 3.59 |
| 44785.854166666664 | 3.57 |
| 44785.864583333336 | 3.67 |
| 44785.875 | 3.91 |
| 44785.885416666664 | 4.13 |
| 44785.895833333336 | 4.46 |
| 44785.90625 | 4.7 |
| 44785.916666666664 | 4.76 |
| 44785.927083333336 | 4.8 |
| 44785.9375 | 4.91 |
| 44785.947916666664 | 5.03 |
| 44785.958333333336 | 5.15 |
| 44785.96875 | 5.17 |
| 44785.979166666664 | 5.08 |
| 44785.989583333336 | 5.05 |
| 44786.0 | 5.06 |
| 44786.010416666664 | 5.1 |
| 44786.020833333336 | 5.12 |
| 44786.03125 | 5.07 |
| 44786.041666666664 | 4.94 |
| 44786.052083333336 | 4.79 |
| 44786.0625 | 4.7 |
| 44786.072916666664 | 4.63 |
| 44786.083333333336 | 4.56 |
| 44786.09375 | 4.42 |
| 44786.104166666664 | 4.42 |
| 44786.114583333336 | 4.02 |
| 44786.125 | 4.56 |
| 44786.135416666664 | 4.4 |
| 44786.145833333336 | 4.41 |
| 44786.15625 | 4.37 |
| 44786.166666666664 | 4.33 |
| 44786.177083333336 | 4.23 |
| 44786.1875 | 4.15 |
| 44786.197916666664 | 4 |
| 44786.208333333336 | 3.91 |
| 44786.21875 | 3.78 |
| 44786.229166666664 | 3.64 |
| 44786.239583333336 | 3.66 |
| 44786.25 | 3.53 |
| 44786.260416666664 | 3.45 |
| 44786.270833333336 | 3.53 |
| 44786.28125 | 3.56 |
| 44786.291666666664 | 3.49 |
| 44786.302083333336 | 3.45 |
| 44786.3125 | 3.25 |
| 44786.322916666664 | 3.17 |
| 44786.333333333336 | 2.94 |
| 44786.34375 | 2.77 |
| 44786.354166666664 | 2.59 |
| 44786.364583333336 | 2.44 |
| 44786.375 | 2.65 |
| 44786.385416666664 | 2.53 |
| 44786.395833333336 | 2.66 |
| 44786.40625 | 2.82 |
| 44786.416666666664 | 2.94 |
| 44786.427083333336 | 3.13 |
| 44786.4375 | 3.31 |
| 44786.447916666664 | 3.49 |
| 44786.458333333336 | 3.57 |
| 44786.46875 | 3.61 |
| 44786.479166666664 | 3.79 |
| 44786.489583333336 | 3.88 |
| 44786.5 | 3.94 |
| 44786.510416666664 | 4.04 |
| 44786.520833333336 | 4.17 |
| 44786.53125 | 4.24 |
| 44786.541666666664 | 4.34 |
| 44786.552083333336 | 4.41 |
| 44786.5625 | 4.52 |
| 44786.572916666664 | 4.55 |
| 44786.583333333336 | 4.57 |
| 44786.59375 | 4.64 |
| 44786.604166666664 | 4.65 |
| 44786.614583333336 | 4.45 |
| 44786.625 | 4.28 |
| 44786.635416666664 | 4.65 |
| 44786.645833333336 | 4.67 |
| 44786.65625 | 4.86 |
| 44786.666666666664 | 4.81 |
| 44786.677083333336 | 4.81 |
| 44786.6875 | 4.93 |
| 44786.697916666664 | 4.93 |
| 44786.708333333336 | 5.1 |
| 44786.71875 | 5.07 |
| 44786.729166666664 | 5.12 |
| 44786.739583333336 | 5.27 |
| 44786.75 | 5.31 |
| 44786.760416666664 | 5.21 |
| 44786.770833333336 | 5.25 |
| 44786.78125 | 5.27 |
| 44786.791666666664 | 5.3 |
| 44786.802083333336 | 5.17 |
| 44786.8125 | 5.15 |
| 44786.822916666664 | 5.05 |
| 44786.833333333336 | 5.15 |
| 44786.84375 | 4.96 |
| 44786.854166666664 | 4.96 |
| 44786.864583333336 | 4.92 |
| 44786.875 | 4.97 |
| 44786.885416666664 | 4.88 |
| 44786.895833333336 | 4.9 |
| 44786.90625 | 4.95 |
| 44786.916666666664 | 5.25 |
| 44786.927083333336 | 5.26 |
| 44786.9375 | 5.67 |
| 44786.947916666664 | 5.71 |
| 44786.958333333336 | 5.7 |
| 44786.96875 | 5.62 |
| 44786.979166666664 | 5.62 |
| 44786.989583333336 | 5.65 |
| 44787.0 | 5.69 |
| 44787.010416666664 | 5.69 |
| 44787.020833333336 | 5.67 |
| 44787.03125 | 5.6 |
| 44787.041666666664 | 5.59 |
| 44787.052083333336 | 5.59 |
| 44787.0625 | 5.59 |
| 44787.072916666664 | 5.56 |
| 44787.083333333336 | 5.5 |
| 44787.09375 | 5.43 |
| 44787.104166666664 | 5.35 |
| 44787.114583333336 | 5.25 |
| 44787.125 | 5.16 |
| 44787.135416666664 | 5.05 |
| 44787.145833333336 | 5.13 |
| 44787.15625 | 5.14 |
| 44787.166666666664 | 5.06 |
| 44787.177083333336 | 5.01 |
| 44787.1875 | 4.82 |
| 44787.197916666664 | 4.77 |
| 44787.208333333336 | 4.65 |
| 44787.21875 | 4.53 |
| 44787.229166666664 | 4.45 |
| 44787.239583333336 | 4.35 |
| 44787.25 | 4.19 |
| 44787.260416666664 | 4.29 |
| 44787.270833333336 | 4.25 |
| 44787.28125 | 4.16 |
| 44787.291666666664 | 4.27 |
| 44787.302083333336 | 4.28 |
| 44787.3125 | 4.09 |
| 44787.322916666664 | 3.98 |
| 44787.333333333336 | 3.87 |
| 44787.34375 | 3.7 |
| 44787.354166666664 | 3.51 |
| 44787.364583333336 | 3.32 |
| 44787.375 | 3.11 |
| 44787.385416666664 | 3 |
| 44787.395833333336 | 2.89 |
| 44787.40625 | 3.25 |
| 44787.416666666664 | 3.09 |
| 44787.427083333336 | 3.23 |
| 44787.4375 | 3.32 |
| 44787.447916666664 | 3.47 |
| 44787.458333333336 | 3.59 |
| 44787.46875 | 3.68 |
| 44787.479166666664 | 3.75 |
| 44787.489583333336 | 3.79 |
| 44787.5 | 3.86 |
| 44787.510416666664 | 3.93 |
| 44787.520833333336 | 3.99 |
| 44787.53125 | 4.01 |
| 44787.541666666664 | 4.08 |
| 44787.552083333336 | 4.23 |
| 44787.5625 | 4.32 |
| 44787.572916666664 | 4.43 |
| 44787.583333333336 | 4.53 |
| 44787.59375 | 4.63 |
| 44787.604166666664 | 4.65 |
| 44787.614583333336 | 4.67 |
| 44787.625 | 4.62 |
| 44787.635416666664 | 4.67 |
| 44787.645833333336 | 4.58 |
| 44787.65625 | 4.47 |
| 44787.666666666664 | 4.79 |
| 44787.677083333336 | 4.84 |
| 44787.6875 | 5 |
| 44787.697916666664 | 4.99 |
| 44787.708333333336 | 5.11 |
| 44787.71875 | 4.94 |
| 44787.729166666664 | 5.09 |
| 44787.739583333336 | 5.15 |
| 44787.75 | 5.12 |
| 44787.760416666664 | 5.13 |
| 44787.770833333336 | 5.26 |
| 44787.78125 | 5.31 |
| 44787.791666666664 | 5.27 |
| 44787.802083333336 | 5.29 |
| 44787.8125 | 5.32 |
| 44787.822916666664 | 5.24 |
| 44787.833333333336 | 5.21 |
| 44787.84375 | 5.14 |
| 44787.854166666664 | 5.04 |
| 44787.864583333336 | 5.03 |
| 44787.875 | 5.02 |
| 44787.885416666664 | 4.95 |
| 44787.895833333336 | 4.95 |
| 44787.90625 | 4.98 |
| 44787.916666666664 | 4.91 |
| 44787.927083333336 | 4.86 |
| 44787.9375 | 4.93 |
| 44787.947916666664 | 5.22 |
| 44787.958333333336 | 5.25 |
| 44787.96875 | 5.43 |
| 44787.979166666664 | 5.53 |
| 44787.989583333336 | 5.6 |
| 44788.0 | 5.52 |
| 44788.010416666664 | 5.51 |
| 44788.020833333336 | 5.52 |
| 44788.03125 | 5.57 |
| 44788.041666666664 | 5.6 |
| 44788.052083333336 | 5.6 |
| 44788.0625 | 5.58 |
| 44788.072916666664 | 5.59 |
| 44788.083333333336 | 5.61 |
| 44788.09375 | 5.63 |
| 44788.104166666664 | 5.67 |
| 44788.114583333336 | 5.67 |
| 44788.125 | 5.64 |
| 44788.135416666664 | 5.59 |
| 44788.145833333336 | 5.51 |
| 44788.15625 | 5.44 |
| 44788.166666666664 | 5.37 |
| 44788.177083333336 | 5.15 |
| 44788.1875 | 5.25 |
| 44788.197916666664 | 5.14 |
| 44788.208333333336 | 4.94 |
| 44788.21875 | 4.77 |
| 44788.229166666664 | 4.72 |
| 44788.239583333336 | 4.7 |
| 44788.25 | 4.65 |
| 44788.260416666664 | 4.56 |
| 44788.270833333336 | 4.27 |
| 44788.28125 | 4.29 |
| 44788.291666666664 | 4.39 |
| 44788.302083333336 | 4.34 |
| 44788.3125 | 4.38 |
| 44788.322916666664 | 4.31 |
| 44788.333333333336 | 4.14 |
| 44788.34375 | 4.04 |
| 44788.354166666664 | 3.88 |
| 44788.364583333336 | 3.76 |
| 44788.375 | 3.72 |
| 44788.385416666664 | 3.53 |
| 44788.395833333336 | 3.31 |
| 44788.40625 | 3.2 |
| 44788.416666666664 | 3.1 |
| 44788.427083333336 | 3.27 |
| 44788.4375 | 3.29 |
| 44788.447916666664 | 3.33 |
| 44788.458333333336 | 3.41 |
| 44788.46875 | 3.48 |
| 44788.479166666664 | 3.63 |
| 44788.489583333336 | 3.73 |
| 44788.5 | 3.79 |
| 44788.510416666664 | 3.87 |
| 44788.520833333336 | 3.92 |
| 44788.53125 | 4.02 |
| 44788.541666666664 | 4.11 |
| 44788.552083333336 | 4.18 |
| 44788.5625 | 4.26 |
| 44788.572916666664 | 4.4 |
| 44788.583333333336 | 4.57 |
| 44788.59375 | 4.74 |
| 44788.604166666664 | 4.86 |
| 44788.614583333336 | 5.03 |
| 44788.625 | 5.13 |
| 44788.635416666664 | 5.21 |
| 44788.645833333336 | 5.24 |
| 44788.65625 | 5.29 |
| 44788.666666666664 | 5.29 |
| 44788.677083333336 | 5.19 |
| 44788.6875 | 5.18 |
| 44788.697916666664 | 5.36 |
| 44788.708333333336 | 5.4 |
| 44788.71875 | 5.36 |
| 44788.729166666664 | 5.35 |
| 44788.739583333336 | 5.33 |
| 44788.75 | 5.29 |
| 44788.760416666664 | 5.23 |
| 44788.770833333336 | 5.11 |
| 44788.78125 | 4.95 |
| 44788.791666666664 | 5.04 |
| 44788.802083333336 | 4.98 |
| 44788.8125 | 4.97 |
| 44788.822916666664 | 5.03 |
| 44788.833333333336 | 5.1 |
| 44788.84375 | 5.12 |
| 44788.854166666664 | 5.06 |
| 44788.864583333336 | 5.05 |
| 44788.875 | 4.96 |
| 44788.885416666664 | 4.85 |
| 44788.895833333336 | 4.77 |
| 44788.90625 | 4.62 |
| 44788.916666666664 | 4.43 |
| 44788.927083333336 | 4.51 |
| 44788.9375 | 4.17 |
| 44788.947916666664 | 4.4 |
| 44788.958333333336 | 4.28 |
| 44788.96875 | 4.33 |
| 44788.979166666664 | 4.39 |
| 44788.989583333336 | 4.45 |
| 44789.0 | 4.65 |
| 44789.010416666664 | 4.75 |
| 44789.020833333336 | 4.8 |
| 44789.03125 | 4.77 |
| 44789.041666666664 | 4.74 |
| 44789.052083333336 | 4.76 |
| 44789.0625 | 4.77 |
| 44789.072916666664 | 4.78 |
| 44789.083333333336 | 4.82 |
| 44789.09375 | 4.89 |
| 44789.104166666664 | 4.92 |
| 44789.114583333336 | 4.99 |
| 44789.125 | 5 |
| 44789.135416666664 | 5.08 |
| 44789.145833333336 | 5.08 |
| 44789.15625 | 5.13 |
| 44789.166666666664 | 5.16 |
| 44789.177083333336 | 5.07 |
| 44789.1875 | 4.98 |
| 44789.197916666664 | 4.99 |
| 44789.208333333336 | 4.61 |
| 44789.21875 | 4.68 |
| 44789.229166666664 | 4.61 |
| 44789.239583333336 | 4.51 |
| 44789.25 | 4.57 |
| 44789.260416666664 | 4.33 |
| 44789.270833333336 | 4.3 |
| 44789.28125 | 4.22 |
| 44789.291666666664 | 4.02 |
| 44789.302083333336 | 4.01 |
| 44789.3125 | 3.85 |
| 44789.322916666664 | 3.75 |
| 44789.333333333336 | 3.81 |
| 44789.34375 | 3.88 |
| 44789.354166666664 | 3.76 |
| 44789.364583333336 | 3.77 |
| 44789.375 | 3.71 |
| 44789.385416666664 | 3.57 |
| 44789.395833333336 | 3.5 |
| 44789.40625 | 3.4 |
| 44789.416666666664 | 3.34 |
| 44789.427083333336 | 3.28 |
| 44789.4375 | 3.23 |
| 44789.447916666664 | 3.12 |
| 44789.458333333336 | 3.21 |
| 44789.46875 | 3.25 |
| 44789.479166666664 | 3.22 |
| 44789.489583333336 | 3.3 |
| 44789.5 | 3.39 |
| 44789.510416666664 | 3.48 |
| 44789.520833333336 | 3.64 |
| 44789.53125 | 3.92 |
| 44789.541666666664 | 3.99 |
| 44789.552083333336 | 4.06 |
| 44789.5625 | 4.24 |
| 44789.572916666664 | 4.4 |
| 44789.583333333336 | 4.55 |
| 44789.59375 | 4.69 |
| 44789.604166666664 | 4.85 |
| 44789.614583333336 | 4.92 |
| 44789.625 | 5.08 |
| 44789.635416666664 | 5.18 |
| 44789.645833333336 | 5.29 |
| 44789.65625 | 5.36 |
| 44789.666666666664 | 5.48 |
| 44789.677083333336 | 5.53 |
| 44789.6875 | 5.58 |
| 44789.697916666664 | 5.68 |
| 44789.708333333336 | 5.62 |
| 44789.71875 | 5.83 |
| 44789.729166666664 | 5.83 |
| 44789.739583333336 | 5.87 |
| 44789.75 | 5.93 |
| 44789.760416666664 | 5.9 |
| 44789.770833333336 | 5.91 |
| 44789.78125 | 5.99 |
| 44789.791666666664 | 6 |
| 44789.802083333336 | 6.09 |
| 44789.8125 | 6.17 |
| 44789.822916666664 | 6.18 |
| 44789.833333333336 | 6.15 |
| 44789.84375 | 6.26 |
| 44789.854166666664 | 6.25 |
| 44789.864583333336 | 6.25 |
| 44789.875 | 6.26 |
| 44789.885416666664 | 6.26 |
| 44789.895833333336 | 6.23 |
| 44789.90625 | 6.2 |
| 44789.916666666664 | 6.18 |
| 44789.927083333336 | 6.14 |
| 44789.9375 | 6.08 |
| 44789.947916666664 | 6.02 |
| 44789.958333333336 | 5.96 |
| 44789.96875 | 5.87 |
| 44789.979166666664 | 5.73 |
| 44789.989583333336 | 5.7 |
| 44790.0 | 5.65 |
| 44790.010416666664 | 5.64 |
| 44790.020833333336 | 5.59 |
| 44790.03125 | 5.65 |
| 44790.041666666664 | 5.69 |
| 44790.052083333336 | 5.77 |
| 44790.0625 | 5.82 |
| 44790.072916666664 | 5.85 |
| 44790.083333333336 | 5.83 |
| 44790.09375 | 5.8 |
| 44790.104166666664 | 5.79 |
| 44790.114583333336 | 5.78 |
| 44790.125 | 5.79 |
| 44790.135416666664 | 5.75 |
| 44790.145833333336 | 5.78 |
| 44790.15625 | 5.79 |
| 44790.166666666664 | 5.82 |
| 44790.177083333336 | 5.82 |
| 44790.1875 | 5.84 |
| 44790.197916666664 | 5.83 |
| 44790.208333333336 | 5.8 |
| 44790.21875 | 5.75 |
| 44790.229166666664 | 5.6 |
| 44790.239583333336 | 5.41 |
| 44790.25 | 5.55 |
| 44790.260416666664 | 5.42 |
| 44790.270833333336 | 5.23 |
| 44790.28125 | 5.14 |
| 44790.291666666664 | 4.94 |
| 44790.302083333336 | 4.92 |
| 44790.3125 | 4.7 |
| 44790.322916666664 | 4.68 |
| 44790.333333333336 | 4.68 |
| 44790.34375 | 4.58 |
| 44790.354166666664 | 4.5 |
| 44790.364583333336 | 4.47 |
| 44790.375 | 4.56 |
| 44790.385416666664 | 4.52 |
| 44790.395833333336 | 4.48 |
| 44790.40625 | 4.39 |
| 44790.416666666664 | 4.34 |
| 44790.427083333336 | 4.29 |
| 44790.4375 | 4.28 |
| 44790.447916666664 | 4.26 |
| 44790.458333333336 | 4.17 |
| 44790.46875 | 4.19 |
| 44790.479166666664 | 4.19 |
| 44790.489583333336 | 4.2 |
| 44790.5 | 4.09 |
| 44790.510416666664 | 4.18 |
| 44790.520833333336 | 4.15 |
| 44790.53125 | 4.16 |
| 44790.541666666664 | 4.22 |
| 44790.552083333336 | 4.42 |
| 44790.5625 | 4.63 |
| 44790.572916666664 | 5.01 |
| 44790.583333333336 | 5.1 |
| 44790.59375 | 5.06 |
| 44790.604166666664 | 5.07 |
| 44790.614583333336 | 5.14 |
| 44790.625 | 5.2 |
| 44790.635416666664 | 5.35 |
| 44790.645833333336 | 5.49 |
| 44790.65625 | 5.54 |
| 44790.666666666664 | 5.68 |
| 44790.677083333336 | 5.75 |
| 44790.6875 | 5.83 |
| 44790.697916666664 | 5.96 |
| 44790.708333333336 | 6.15 |
| 44790.71875 | 6.14 |
| 44790.729166666664 | 6.26 |
| 44790.739583333336 | 6.3 |
| 44790.75 | 6.35 |
| 44790.760416666664 | 6.4 |
| 44790.770833333336 | 6.62 |
| 44790.78125 | 6.67 |
| 44790.791666666664 | 6.69 |
| 44790.802083333336 | 6.69 |
| 44790.8125 | 6.61 |
| 44790.822916666664 | 6.6 |
| 44790.833333333336 | 6.58 |
| 44790.84375 | 6.6 |
| 44790.854166666664 | 6.65 |
| 44790.864583333336 | 6.62 |
| 44790.875 | 6.61 |
| 44790.885416666664 | 6.64 |
| 44790.895833333336 | 6.64 |
| 44790.90625 | 6.62 |
| 44790.916666666664 | 6.55 |
| 44790.927083333336 | 6.57 |
| 44790.9375 | 6.49 |
| 44790.947916666664 | 6.43 |
| 44790.958333333336 | 6.43 |
| 44790.96875 | 6.33 |
| 44790.979166666664 | 6.24 |
| 44790.989583333336 | 6.25 |
| 44791.0 | 6.16 |
| 44791.010416666664 | 6.04 |
| 44791.020833333336 | 6.09 |
| 44791.03125 | 5.82 |
| 44791.041666666664 | 5.9 |
| 44791.052083333336 | 5.98 |
| 44791.0625 | 5.94 |
| 44791.072916666664 | 5.95 |
| 44791.083333333336 | 5.96 |
| 44791.09375 | 6 |
| 44791.104166666664 | 6.05 |
| 44791.114583333336 | 6.06 |
| 44791.125 | 6 |
| 44791.135416666664 | 5.95 |
| 44791.145833333336 | 5.91 |
| 44791.15625 | 5.88 |
| 44791.166666666664 | 5.86 |
| 44791.177083333336 | 5.81 |
| 44791.1875 | 5.76 |
| 44791.197916666664 | 5.75 |
| 44791.208333333336 | 5.7 |
| 44791.21875 | 5.69 |
| 44791.229166666664 | 5.63 |
| 44791.239583333336 | 5.55 |
| 44791.25 | 5.51 |
| 44791.260416666664 | 5.28 |
| 44791.270833333336 | 5.34 |
| 44791.28125 | 5.28 |
| 44791.291666666664 | 5.34 |
| 44791.302083333336 | 5.54 |
| 44791.3125 | 5.22 |
| 44791.322916666664 | 5.03 |
| 44791.333333333336 | 5.13 |
| 44791.34375 | 4.92 |
| 44791.354166666664 | 4.97 |
| 44791.364583333336 | 5.03 |
| 44791.375 | 4.78 |
| 44791.385416666664 | 4.8 |
| 44791.395833333336 | 4.78 |
| 44791.40625 | 4.89 |
| 44791.416666666664 | 4.69 |
| 44791.427083333336 | 4.62 |
| 44791.4375 | 4.49 |
| 44791.447916666664 | 4.4 |
| 44791.458333333336 | 4.29 |
| 44791.46875 | 4.23 |
| 44791.479166666664 | 4.2 |
| 44791.489583333336 | 4.15 |
| 44791.5 | 4.06 |
| 44791.510416666664 | 4.04 |
| 44791.520833333336 | 4.08 |
| 44791.53125 | 4.03 |
| 44791.541666666664 | 4.02 |
| 44791.552083333336 | 4.02 |
| 44791.5625 | 4.04 |
| 44791.572916666664 | 4.05 |
| 44791.583333333336 | 4.17 |
| 44791.59375 | 4.39 |
| 44791.604166666664 | 4.65 |
| 44791.614583333336 | 4.89 |
| 44791.625 | 4.85 |
| 44791.635416666664 | 4.92 |
| 44791.645833333336 | 4.95 |
| 44791.65625 | 5.09 |
| 44791.666666666664 | 5.15 |
| 44791.677083333336 | 5.22 |
| 44791.6875 | 5.35 |
| 44791.697916666664 | 5.42 |
| 44791.708333333336 | 5.62 |
| 44791.71875 | 5.74 |
| 44791.729166666664 | 5.81 |
| 44791.739583333336 | 5.9 |
| 44791.75 | 6.13 |
| 44791.760416666664 | 6.2 |
| 44791.770833333336 | 5.96 |
| 44791.78125 | 6.2 |
| 44791.791666666664 | 6.02 |
| 44791.802083333336 | 6.13 |
| 44791.8125 | 6.43 |
| 44791.822916666664 | 6.51 |
| 44791.833333333336 | 6.58 |
| 44791.84375 | 6.58 |
| 44791.854166666664 | 6.61 |
| 44791.864583333336 | 6.62 |
| 44791.875 | 6.63 |
| 44791.885416666664 | 6.56 |
| 44791.895833333336 | 6.54 |
| 44791.90625 | 6.44 |
| 44791.916666666664 | 6.32 |
| 44791.927083333336 | 6.27 |
| 44791.9375 | 6.17 |
| 44791.947916666664 | 6.08 |
| 44791.958333333336 | 6.05 |
| 44791.96875 | 6.05 |
| 44791.979166666664 | 5.96 |
| 44791.989583333336 | 5.89 |
| 44792.0 | 5.85 |
| 44792.010416666664 | 5.8 |
| 44792.020833333336 | 5.74 |
| 44792.03125 | 5.67 |
| 44792.041666666664 | 5.61 |
| 44792.052083333336 | 5.38 |
| 44792.0625 | 5.37 |
| 44792.072916666664 | 5.35 |
| 44792.083333333336 | 5.23 |
| 44792.09375 | 5.28 |
| 44792.104166666664 | 5.23 |
| 44792.114583333336 | 5.34 |
| 44792.125 | 5.42 |
| 44792.135416666664 | 5.48 |
| 44792.145833333336 | 5.46 |
| 44792.15625 | 5.41 |
| 44792.166666666664 | 5.36 |
| 44792.177083333336 | 5.3 |
| 44792.1875 | 5.31 |
| 44792.197916666664 | 5.29 |
| 44792.208333333336 | 5.23 |
| 44792.21875 | 5.18 |
| 44792.229166666664 | 5.25 |
| 44792.239583333336 | 5.23 |
| 44792.25 | 5.2 |
| 44792.260416666664 | 5.24 |
| 44792.270833333336 | 5.17 |
| 44792.28125 | 5.14 |
| 44792.291666666664 | 4.85 |
| 44792.302083333336 | 4.73 |
| 44792.3125 | 4.61 |
| 44792.322916666664 | 4.68 |
| 44792.333333333336 | 5.25 |
| 44792.34375 | 4.74 |
| 44792.354166666664 | 4.84 |
| 44792.364583333336 | 4.86 |
| 44792.375 | 4.86 |
| 44792.385416666664 | 4.75 |
| 44792.395833333336 | 4.52 |
| 44792.40625 | 4.66 |
| 44792.416666666664 | 4.45 |
| 44792.427083333336 | 4.3 |
| 44792.4375 | 4.15 |
| 44792.447916666664 | 4.06 |
| 44792.458333333336 | 3.96 |
| 44792.46875 | 3.84 |
| 44792.479166666664 | 3.74 |
| 44792.489583333336 | 3.74 |
| 44792.5 | 3.73 |
| 44792.510416666664 | 3.74 |
| 44792.520833333336 | 3.72 |
| 44792.53125 | 3.77 |
| 44792.541666666664 | 3.55 |
| 44792.552083333336 | 3.42 |
| 44792.5625 | 3.52 |
| 44792.572916666664 | 3.49 |
| 44792.583333333336 | 3.53 |
| 44792.59375 | 3.55 |
| 44792.604166666664 | 3.67 |
| 44792.614583333336 | 4.21 |
| 44792.625 | 4.37 |
| 44792.635416666664 | 4.51 |
| 44792.645833333336 | 4.69 |
| 44792.65625 | 4.87 |
| 44792.666666666664 | 5.09 |
| 44792.677083333336 | 5.28 |
| 44792.6875 | 5.47 |
| 44792.697916666664 | 5.62 |
| 44792.708333333336 | 5.76 |
| 44792.71875 | 5.87 |
| 44792.729166666664 | 5.96 |
| 44792.739583333336 | 6.01 |
| 44792.75 | 6.2 |
| 44792.760416666664 | 6.21 |
| 44792.770833333336 | 6.22 |
| 44792.78125 | 6.35 |
| 44792.791666666664 | 6.36 |
| 44792.802083333336 | 6.38 |
| 44792.8125 | 6.32 |
| 44792.822916666664 | 6.28 |
| 44792.833333333336 | 5.87 |
| 44792.84375 | 6.18 |
| 44792.854166666664 | 6.55 |
| 44792.864583333336 | 6.54 |
| 44792.875 | 6.41 |
| 44792.885416666664 | 6.4 |
| 44792.895833333336 | 6.26 |
| 44792.90625 | 6.21 |
| 44792.916666666664 | 6.1 |
| 44792.927083333336 | 6.02 |
| 44792.9375 | 5.82 |
| 44792.947916666664 | 5.95 |
| 44792.958333333336 | 5.76 |
| 44792.96875 | 5.68 |
| 44792.979166666664 | 5.5 |
| 44792.989583333336 | 5.42 |
| 44793.0 | 5.57 |
| 44793.010416666664 | 5.52 |
| 44793.020833333336 | 5.36 |
| 44793.03125 | 5.24 |
| 44793.041666666664 | 5.19 |
| 44793.052083333336 | 5.14 |
| 44793.0625 | 5.03 |
| 44793.072916666664 | 4.94 |
| 44793.083333333336 | 4.99 |
| 44793.09375 | 4.98 |
| 44793.104166666664 | 4.79 |
| 44793.114583333336 | 4.8 |
| 44793.125 | 4.74 |
| 44793.135416666664 | 4.76 |
| 44793.145833333336 | 4.76 |
| 44793.15625 | 4.82 |
| 44793.166666666664 | 4.87 |
| 44793.177083333336 | 5.01 |
| 44793.1875 | 5.06 |
| 44793.197916666664 | 5.04 |
| 44793.208333333336 | 5.03 |
| 44793.21875 | 5.01 |
| 44793.229166666664 | 4.99 |
| 44793.239583333336 | 4.98 |
| 44793.25 | 4.94 |
| 44793.260416666664 | 4.92 |
| 44793.270833333336 | 4.88 |
| 44793.28125 | 4.85 |
| 44793.291666666664 | 4.84 |
| 44793.302083333336 | 4.76 |
| 44793.3125 | 4.72 |
| 44793.322916666664 | 4.76 |
| 44793.333333333336 | 4.2 |
| 44793.34375 | 4.18 |
| 44793.354166666664 | 4.3 |
| 44793.364583333336 | 4.7 |
| 44793.375 | 4.8 |
| 44793.385416666664 | 4.47 |
| 44793.395833333336 | 4.59 |
| 44793.40625 | 4.38 |
| 44793.416666666664 | 4.57 |
| 44793.427083333336 | 4.4 |
| 44793.4375 | 4.19 |
| 44793.447916666664 | 4.1 |
| 44793.458333333336 | 4.18 |
| 44793.46875 | 4.05 |
| 44793.479166666664 | 3.87 |
| 44793.489583333336 | 3.86 |
| 44793.5 | 3.77 |
| 44793.510416666664 | 3.71 |
| 44793.520833333336 | 3.63 |
| 44793.53125 | 3.66 |
| 44793.541666666664 | 3.57 |
| 44793.552083333336 | 3.57 |
| 44793.5625 | 3.57 |
| 44793.572916666664 | 3.6 |
| 44793.583333333336 | 3.63 |
| 44793.59375 | 3.75 |
| 44793.604166666664 | 3.56 |
| 44793.614583333336 | 3.64 |
| 44793.625 | 3.59 |
| 44793.635416666664 | 3.7 |
| 44793.645833333336 | 3.96 |
| 44793.65625 | 4.08 |
| 44793.666666666664 | 4.35 |
| 44793.677083333336 | 4.51 |
| 44793.6875 | 4.69 |
| 44793.697916666664 | 4.9 |
| 44793.708333333336 | 4.97 |
| 44793.71875 | 5.19 |
| 44793.729166666664 | 5.4 |
| 44793.739583333336 | 5.56 |
| 44793.75 | 5.75 |
| 44793.760416666664 | 6.04 |
| 44793.770833333336 | 5.9 |
| 44793.78125 | 6.08 |
| 44793.791666666664 | 6.21 |
| 44793.802083333336 | 6.54 |
| 44793.8125 | 6.67 |
| 44793.822916666664 | 6.59 |
| 44793.833333333336 | 6.72 |
| 44793.84375 | 6.76 |
| 44793.854166666664 | 6.49 |
| 44793.864583333336 | 6.7 |
| 44793.875 | 6.5 |
| 44793.885416666664 | 6.96 |
| 44793.895833333336 | 6.88 |
| 44793.90625 | 6.78 |
| 44793.916666666664 | 6.72 |
| 44793.927083333336 | 6.63 |
| 44793.9375 | 6.52 |
| 44793.947916666664 | 6.4 |
| 44793.958333333336 | 6.19 |
| 44793.96875 | 5.98 |
| 44793.979166666664 | 5.87 |
| 44793.989583333336 | 5.93 |
| 44794.0 | 5.68 |
| 44794.010416666664 | 5.4 |
| 44794.020833333336 | 5.6 |
| 44794.03125 | 5.59 |
| 44794.041666666664 | 5.61 |
| 44794.052083333336 | 5.53 |
| 44794.0625 | 5.45 |
| 44794.072916666664 | 5.34 |
| 44794.083333333336 | 5.24 |
| 44794.09375 | 5.15 |
| 44794.104166666664 | 5.07 |
| 44794.114583333336 | 5.04 |
| 44794.125 | 5.02 |
| 44794.135416666664 | 4.81 |
| 44794.145833333336 | 4.82 |
| 44794.15625 | 4.78 |
| 44794.166666666664 | 4.74 |
| 44794.177083333336 | 4.77 |
| 44794.1875 | 4.78 |
| 44794.197916666664 | 4.8 |
| 44794.208333333336 | 4.86 |
| 44794.21875 | 4.91 |
| 44794.229166666664 | 4.98 |
| 44794.239583333336 | 5.01 |
| 44794.25 | 4.99 |
| 44794.260416666664 | 4.96 |
| 44794.270833333336 | 4.95 |
| 44794.28125 | 4.93 |
| 44794.291666666664 | 4.89 |
| 44794.302083333336 | 4.86 |
| 44794.3125 | 4.83 |
| 44794.322916666664 | 4.8 |
| 44794.333333333336 | 4.72 |
| 44794.34375 | 4.69 |
| 44794.354166666664 | 4.69 |
| 44794.364583333336 | 4.51 |
| 44794.375 | 3.95 |
| 44794.385416666664 | 4.27 |
| 44794.395833333336 | 4.15 |
| 44794.40625 | 4.19 |
| 44794.416666666664 | 4.7 |
| 44794.427083333336 | 4.61 |
| 44794.4375 | 4.49 |
| 44794.447916666664 | 4.48 |
| 44794.458333333336 | 4.2 |
| 44794.46875 | 4.5 |
| 44794.479166666664 | 4.16 |
| 44794.489583333336 | 4.19 |
| 44794.5 | 4.13 |
| 44794.510416666664 | 4.02 |
| 44794.520833333336 | 3.95 |
| 44794.53125 | 3.86 |
| 44794.541666666664 | 3.88 |
| 44794.552083333336 | 3.76 |
| 44794.5625 | 3.8 |
| 44794.572916666664 | 3.69 |
| 44794.583333333336 | 3.69 |
| 44794.59375 | 3.85 |
| 44794.604166666664 | 3.84 |
| 44794.614583333336 | 3.9 |
| 44794.625 | 4 |
| 44794.635416666664 | 4.07 |
| 44794.645833333336 | 3.89 |
| 44794.65625 | 3.82 |
| 44794.666666666664 | 3.84 |
| 44794.677083333336 | 4.05 |
| 44794.6875 | 4.26 |
| 44794.697916666664 | 4.43 |
| 44794.708333333336 | 4.64 |
| 44794.71875 | 4.85 |
| 44794.729166666664 | 5.15 |
| 44794.739583333336 | 5.21 |
| 44794.75 | 5.43 |
| 44794.760416666664 | 5.53 |
| 44794.770833333336 | 5.78 |
| 44794.78125 | 5.99 |
| 44794.791666666664 | 6.11 |
| 44794.802083333336 | 6.39 |
| 44794.8125 | 6.41 |
| 44794.822916666664 | 6.8 |
| 44794.833333333336 | 6.7 |
| 44794.84375 | 6.8 |
| 44794.854166666664 | 8.05 |
| 44794.864583333336 | 6.88 |
| 44794.875 | 6.88 |
| 44794.885416666664 | 6.92 |
| 44794.895833333336 | 6.89 |
| 44794.90625 | 6.85 |
| 44794.916666666664 | 6.7 |
| 44794.927083333336 | 6.63 |
| 44794.9375 | 6.74 |
| 44794.947916666664 | 6.93 |
| 44794.958333333336 | 6.83 |
| 44794.96875 | 6.65 |
| 44794.979166666664 | 6.36 |
| 44794.989583333336 | 6.29 |
| 44795.0 | 6.09 |
| 44795.010416666664 | 6.15 |
| 44795.020833333336 | 5.66 |
| 44795.03125 | 5.65 |
| 44795.041666666664 | 5.13 |
| 44795.052083333336 | 4.94 |
| 44795.0625 | 4.98 |
| 44795.072916666664 | 4.96 |
| 44795.083333333336 | 5.09 |
| 44795.09375 | 5.09 |
| 44795.104166666664 | 5.1 |
| 44795.114583333336 | 5.06 |
| 44795.125 | 5.07 |
| 44795.135416666664 | 4.95 |
| 44795.145833333336 | 4.95 |
| 44795.15625 | 4.79 |
| 44795.166666666664 | 4.64 |
| 44795.177083333336 | 4.7 |
| 44795.1875 | 4.7 |
| 44795.197916666664 | 4.73 |
| 44795.208333333336 | 4.74 |
| 44795.21875 | 4.74 |
| 44795.229166666664 | 4.79 |
| 44795.239583333336 | 4.94 |
| 44795.25 | 4.95 |
| 44795.260416666664 | 4.96 |
| 44795.270833333336 | 4.96 |
| 44795.28125 | 4.89 |
| 44795.291666666664 | 4.87 |
| 44795.302083333336 | 4.83 |
| 44795.3125 | 4.75 |
| 44795.322916666664 | 4.72 |
| 44795.333333333336 | 4.77 |
| 44795.34375 | 4.82 |
| 44795.354166666664 | 4.81 |
| 44795.364583333336 | 4.84 |
| 44795.375 | 4.86 |
| 44795.385416666664 | 4.85 |
| 44795.395833333336 | 4.84 |
| 44795.40625 | 4.8 |
| 44795.416666666664 | 4.39 |
| 44795.427083333336 | 4.45 |
| 44795.4375 | 4.31 |
| 44795.447916666664 | 4.43 |
| 44795.458333333336 | 4.65 |
| 44795.46875 | 4.66 |
| 44795.479166666664 | 4.51 |
| 44795.489583333336 | 4.72 |
| 44795.5 | 4.48 |
| 44795.510416666664 | 4.3 |
| 44795.520833333336 | 4.22 |
| 44795.53125 | 4.1 |
| 44795.541666666664 | 4.03 |
| 44795.552083333336 | 4.05 |
| 44795.5625 | 3.86 |
| 44795.572916666664 | 3.81 |
| 44795.583333333336 | 3.83 |
| 44795.59375 | 3.89 |
| 44795.604166666664 | 3.93 |
| 44795.614583333336 | 4.01 |
| 44795.625 | 4.03 |
| 44795.635416666664 | 4.06 |
| 44795.645833333336 | 3.91 |
| 44795.65625 | 4.11 |
| 44795.666666666664 | 3.96 |
| 44795.677083333336 | 3.99 |
| 44795.6875 | 4.24 |
| 44795.697916666664 | 3.9 |
| 44795.708333333336 | 3.92 |
| 44795.71875 | 4.04 |
| 44795.729166666664 | 4.35 |
| 44795.739583333336 | 4.61 |
| 44795.75 | 5.04 |
| 44795.760416666664 | 5.39 |
| 44795.770833333336 | 5.59 |
| 44795.78125 | 5.73 |
| 44795.791666666664 | 5.93 |
| 44795.802083333336 | 6.05 |
| 44795.8125 | 6.17 |
| 44795.822916666664 | 6.12 |
| 44795.833333333336 | 6.21 |
| 44795.84375 | 6.24 |
| 44795.854166666664 | 6.24 |
| 44795.864583333336 | 6.24 |
| 44795.875 | 6.31 |
| 44795.885416666664 | 6.33 |
| 44795.895833333336 | 6.37 |
| 44795.90625 | 6.38 |
| 44795.916666666664 | 6.46 |
| 44795.927083333336 | 6.5 |
| 44795.9375 | 6.51 |
| 44795.947916666664 | 6.33 |
| 44795.958333333336 | 6.33 |
| 44795.96875 | 6.11 |
| 44795.979166666664 | 6.15 |
| 44795.989583333336 | 6.09 |
| 44796.0 | 6.21 |
| 44796.010416666664 | 6.21 |
| 44796.020833333336 | 6.03 |
| 44796.03125 | 5.77 |
| 44796.041666666664 | 5.75 |
| 44796.052083333336 | 5.44 |
| 44796.0625 | 5.01 |
| 44796.072916666664 | 4.84 |
| 44796.083333333336 | 4.79 |
| 44796.09375 | 4.65 |
| 44796.104166666664 | 4.76 |
| 44796.114583333336 | 4.71 |
| 44796.125 | 4.73 |
| 44796.135416666664 | 4.74 |
| 44796.145833333336 | 4.57 |
| 44796.15625 | 4.57 |
| 44796.166666666664 | 4.6 |
| 44796.177083333336 | 4.59 |
| 44796.1875 | 4.51 |
| 44796.197916666664 | 4.54 |
| 44796.208333333336 | 4.52 |
| 44796.21875 | 4.31 |
| 44796.229166666664 | 4.27 |
| 44796.239583333336 | 4.24 |
| 44796.25 | 4.25 |
| 44796.260416666664 | 4.24 |
| 44796.270833333336 | 4.27 |
| 44796.28125 | 4.34 |
| 44796.291666666664 | 4.4 |
| 44796.302083333336 | 4.46 |
| 44796.3125 | 4.59 |
| 44796.322916666664 | 4.63 |
| 44796.333333333336 | 4.68 |
| 44796.34375 | 4.66 |
| 44796.354166666664 | 4.64 |
| 44796.364583333336 | 4.62 |
| 44796.375 | 4.64 |
| 44796.385416666664 | 4.62 |
| 44796.395833333336 | 4.62 |
| 44796.40625 | 4.59 |
| 44796.416666666664 | 4.63 |
| 44796.427083333336 | 4.55 |
| 44796.4375 | 4.51 |
| 44796.447916666664 | 4.32 |
| 44796.458333333336 | 4.09 |
| 44796.46875 | 4.25 |
| 44796.479166666664 | 4.25 |
| 44796.489583333336 | 4.29 |
| 44796.5 | 4.52 |
| 44796.510416666664 | 4.2 |
| 44796.520833333336 | 4.06 |
| 44796.53125 | 4.05 |
| 44796.541666666664 | 4 |
| 44796.552083333336 | 3.92 |
| 44796.5625 | 4.01 |
| 44796.572916666664 | 3.84 |
| 44796.583333333336 | 3.95 |
| 44796.59375 | 3.92 |
| 44796.604166666664 | 4 |
| 44796.614583333336 | 3.93 |
| 44796.625 | 3.97 |
| 44796.635416666664 | 3.91 |
| 44796.645833333336 | 4.06 |
| 44796.65625 | 4.34 |
| 44796.666666666664 | 4.37 |
| 44796.677083333336 | 4.39 |
| 44796.6875 | 4.42 |
| 44796.697916666664 | 4.44 |
| 44796.708333333336 | 4.38 |
| 44796.71875 | 4.45 |
| 44796.729166666664 | 4.29 |
| 44796.739583333336 | 4.08 |
| 44796.75 | 4.12 |
| 44796.760416666664 | 4.41 |
| 44796.770833333336 | 4.43 |
| 44796.78125 | 4.92 |
| 44796.791666666664 | 5.16 |
| 44796.802083333336 | 5.56 |
| 44796.8125 | 5.83 |
| 44796.822916666664 | 6.06 |
| 44796.833333333336 | 6.32 |
| 44796.84375 | 6.5 |
| 44796.854166666664 | 6.66 |
| 44796.864583333336 | 6.95 |
| 44796.875 | 7.03 |
| 44796.885416666664 | 7.22 |
| 44796.895833333336 | 7.44 |
| 44796.90625 | 7.72 |
| 44796.916666666664 | 7.7 |
| 44796.927083333336 | 7.59 |
| 44796.9375 | 7.4 |
| 44796.947916666664 | 7.23 |
| 44796.958333333336 | 7.14 |
| 44796.96875 | 7.01 |
| 44796.979166666664 | 6.93 |
| 44796.989583333336 | 6.42 |
| 44797.0 | 6.73 |
| 44797.010416666664 | 6.69 |
| 44797.020833333336 | 6.87 |
| 44797.03125 | 6.54 |
| 44797.041666666664 | 6.3 |
| 44797.052083333336 | 6.01 |
| 44797.0625 | 6.1 |
| 44797.072916666664 | 5.68 |
| 44797.083333333336 | 5.47 |
| 44797.09375 | 5.17 |
| 44797.104166666664 | 5.54 |
| 44797.114583333336 | 5.35 |
| 44797.125 | 5.2 |
| 44797.135416666664 | 5.35 |
| 44797.145833333336 | 5.01 |
| 44797.15625 | 5.07 |
| 44797.166666666664 | 4.97 |
| 44797.177083333336 | 4.94 |
| 44797.1875 | 4.98 |
| 44797.197916666664 | 4.98 |
| 44797.208333333336 | 4.99 |
| 44797.21875 | 4.92 |
| 44797.229166666664 | 4.97 |
| 44797.239583333336 | 4.97 |
| 44797.25 | 4.83 |
| 44797.260416666664 | 4.56 |
| 44797.270833333336 | 4.55 |
| 44797.28125 | 4.48 |
| 44797.291666666664 | 4.45 |
| 44797.302083333336 | 4.36 |
| 44797.3125 | 4.32 |
| 44797.322916666664 | 4.34 |
| 44797.333333333336 | 4.47 |
| 44797.34375 | 4.55 |
| 44797.354166666664 | 4.52 |
| 44797.364583333336 | 4.53 |
| 44797.375 | 4.51 |
| 44797.385416666664 | 4.5 |
| 44797.395833333336 | 4.49 |
| 44797.40625 | 4.49 |
| 44797.416666666664 | 4.5 |
| 44797.427083333336 | 4.46 |
| 44797.4375 | 4.49 |
| 44797.447916666664 | 4.48 |
| 44797.458333333336 | 4.47 |
| 44797.46875 | 4.42 |
| 44797.479166666664 | 4.12 |
| 44797.489583333336 | 4.12 |
| 44797.5 | 4.25 |
| 44797.510416666664 | 4.21 |
| 44797.520833333336 | 4.43 |
| 44797.53125 | 4.33 |
| 44797.541666666664 | 4.31 |
| 44797.552083333336 | 4.11 |
| 44797.5625 | 4.11 |
| 44797.572916666664 | 4.1 |
| 44797.583333333336 | 4.2 |
| 44797.59375 | 4.05 |
| 44797.604166666664 | 4.12 |
| 44797.614583333336 | 4.26 |
| 44797.625 | 4.25 |
| 44797.635416666664 | 4.41 |
| 44797.645833333336 | 4.57 |
| 44797.65625 | 4.53 |
| 44797.666666666664 | 4.76 |
| 44797.677083333336 | 4.84 |
| 44797.6875 | 5.03 |
| 44797.697916666664 | 5.16 |
| 44797.708333333336 | 5.31 |
| 44797.71875 | 5.72 |
| 44797.729166666664 | 5.91 |
| 44797.739583333336 | 5.74 |
| 44797.75 | 5.4 |
| 44797.760416666664 | 5.05 |
| 44797.770833333336 | 4.88 |
| 44797.78125 | 4.9 |
| 44797.791666666664 | 4.85 |
| 44797.802083333336 | 4.95 |
| 44797.8125 | 5.03 |
| 44797.822916666664 | 5.32 |
| 44797.833333333336 | 5.62 |
| 44797.84375 | 5.9 |
| 44797.854166666664 | 6.27 |
| 44797.864583333336 | 6.51 |
| 44797.875 | 6.69 |
| 44797.885416666664 | 6.88 |
| 44797.895833333336 | 7.05 |
| 44797.90625 | 7.27 |
| 44797.916666666664 | 7.48 |
| 44797.927083333336 | 7.57 |
| 44797.9375 | 7.72 |
| 44797.947916666664 | 7.58 |
| 44797.958333333336 | 7.33 |
| 44797.96875 | 7.14 |
| 44797.979166666664 | 6.98 |
| 44797.989583333336 | 6.85 |
| 44798.0 | 6.74 |
| 44798.010416666664 | 6.41 |
| 44798.020833333336 | 6.33 |
| 44798.03125 | 6.46 |
| 44798.041666666664 | 6.42 |
| 44798.052083333336 | 6.39 |
| 44798.0625 | 6.43 |
| 44798.072916666664 | 6.23 |
| 44798.083333333336 | 6.01 |
| 44798.09375 | 5.66 |
| 44798.104166666664 | 6.38 |
| 44798.114583333336 | 5.48 |
| 44798.125 | 5.64 |
| 44798.135416666664 | 5.56 |
| 44798.145833333336 | 5.26 |
| 44798.15625 | 5.29 |
| 44798.166666666664 | 5.17 |
| 44798.177083333336 | 5.06 |
| 44798.1875 | 5.15 |
| 44798.197916666664 | 5.19 |
| 44798.208333333336 | 5.23 |
| 44798.21875 | 5.3 |
| 44798.229166666664 | 5.41 |
| 44798.239583333336 | 5.41 |
| 44798.25 | 5.4 |
| 44798.260416666664 | 5.28 |
| 44798.270833333336 | 5.28 |
| 44798.28125 | 4.79 |
| 44798.291666666664 | 4.76 |
| 44798.302083333336 | 4.84 |
| 44798.3125 | 4.79 |
| 44798.322916666664 | 4.7 |
| 44798.333333333336 | 4.56 |
| 44798.34375 | 4.57 |
| 44798.354166666664 | 4.52 |
| 44798.364583333336 | 4.57 |
| 44798.375 | 4.5 |
| 44798.385416666664 | 4.45 |
| 44798.395833333336 | 4.39 |
| 44798.40625 | 4.36 |
| 44798.416666666664 | 4.34 |
| 44798.427083333336 | 4.34 |
| 44798.4375 | 4.39 |
| 44798.447916666664 | 4.4 |
| 44798.458333333336 | 4.39 |
| 44798.46875 | 4.36 |
| 44798.479166666664 | 4.37 |
| 44798.489583333336 | 4.41 |
| 44798.5 | 4.36 |
| 44798.510416666664 | 4.28 |
| 44798.520833333336 | 4.04 |
| 44798.53125 | 4.22 |
| 44798.541666666664 | 4.21 |
| 44798.552083333336 | 4.26 |
| 44798.5625 | 4.23 |
| 44798.572916666664 | 4.25 |
| 44798.583333333336 | 4.23 |
| 44798.59375 | 4.35 |
| 44798.604166666664 | 4.5 |
| 44798.614583333336 | 4.5 |
| 44798.625 | 4.48 |
| 44798.635416666664 | 4.57 |
| 44798.645833333336 | 4.68 |
| 44798.65625 | 4.88 |
| 44798.666666666664 | 5.01 |
| 44798.677083333336 | 5.07 |
| 44798.6875 | 5.24 |
| 44798.697916666664 | 5.37 |
| 44798.708333333336 | 5.53 |
| 44798.71875 | 5.73 |
| 44798.729166666664 | 6.04 |
| 44798.739583333336 | 6.41 |
| 44798.75 | 6.74 |
| 44798.760416666664 | 7.04 |
| 44798.770833333336 | 6.86 |
| 44798.78125 | 6.54 |
| 44798.791666666664 | 6.44 |
| 44798.802083333336 | 6.33 |
| 44798.8125 | 6.25 |
| 44798.822916666664 | 6.38 |
| 44798.833333333336 | 6.35 |
| 44798.84375 | 6.48 |
| 44798.854166666664 | 6.75 |
| 44798.864583333336 | 6.82 |
| 44798.875 | 6.81 |
| 44798.885416666664 | 6.85 |
| 44798.895833333336 | 6.89 |
| 44798.90625 | 7 |
| 44798.916666666664 | 7.11 |
| 44798.927083333336 | 7.2 |
| 44798.9375 | 7.3 |
| 44798.947916666664 | 7.24 |
| 44798.958333333336 | 7.15 |
| 44798.96875 | 6.92 |
| 44798.979166666664 | 6.75 |
| 44798.989583333336 | 6.66 |
| 44799.0 | 6.59 |
| 44799.010416666664 | 6.52 |
| 44799.020833333336 | 6.42 |
| 44799.03125 | 6.36 |
| 44799.041666666664 | 6.24 |
| 44799.052083333336 | 6.25 |
| 44799.0625 | 6.18 |
| 44799.072916666664 | 6.27 |
| 44799.083333333336 | 6.15 |
| 44799.09375 | 6.04 |
| 44799.104166666664 | 5.99 |
| 44799.114583333336 | 5.87 |
| 44799.125 | 5.63 |
| 44799.135416666664 | 5.53 |
| 44799.145833333336 | 5.41 |
| 44799.15625 | 5.36 |
| 44799.166666666664 | 5.3 |
| 44799.177083333336 | 5.43 |
| 44799.1875 | 5.11 |
| 44799.197916666664 | 5.08 |
| 44799.208333333336 | 5.05 |
| 44799.21875 | 4.81 |
| 44799.229166666664 | 4.91 |
| 44799.239583333336 | 4.89 |
| 44799.25 | 4.75 |
| 44799.260416666664 | 4.89 |
| 44799.270833333336 | 4.85 |
| 44799.28125 | 4.77 |
| 44799.291666666664 | 4.83 |
| 44799.302083333336 | 4.35 |
| 44799.3125 | 4.27 |
| 44799.322916666664 | 4.36 |
| 44799.333333333336 | 4.44 |
| 44799.34375 | 4.4 |
| 44799.354166666664 | 4.34 |
| 44799.364583333336 | 4.37 |
| 44799.375 | 4.42 |
| 44799.385416666664 | 4.45 |
| 44799.395833333336 | 4.39 |
| 44799.40625 | 4.37 |
| 44799.416666666664 | 4.32 |
| 44799.427083333336 | 4.28 |
| 44799.4375 | 4.3 |
| 44799.447916666664 | 4.31 |
| 44799.458333333336 | 4.29 |
| 44799.46875 | 4.3 |
| 44799.479166666664 | 4.28 |
| 44799.489583333336 | 4.28 |
| 44799.5 | 4.3 |
| 44799.510416666664 | 4.3 |
| 44799.520833333336 | 4.29 |
| 44799.53125 | 4.32 |
| 44799.541666666664 | 4.37 |
| 44799.552083333336 | 4.06 |
| 44799.5625 | 4.12 |
| 44799.572916666664 | 4.38 |
| 44799.583333333336 | 4.35 |
| 44799.59375 | 4.41 |
| 44799.604166666664 | 4.56 |
| 44799.614583333336 | 4.6 |
| 44799.625 | 4.59 |
| 44799.635416666664 | 4.71 |
| 44799.645833333336 | 4.98 |
| 44799.65625 | 4.89 |
| 44799.666666666664 | 4.98 |
| 44799.677083333336 | 5.18 |
| 44799.6875 | 5.38 |
| 44799.697916666664 | 5.57 |
| 44799.708333333336 | 5.83 |
| 44799.71875 | 6.01 |
| 44799.729166666664 | 6.26 |
| 44799.739583333336 | 6.47 |
| 44799.75 | 6.7 |
| 44799.760416666664 | 6.94 |
| 44799.770833333336 | 7.13 |
| 44799.78125 | 7.23 |
| 44799.791666666664 | 6.95 |
| 44799.802083333336 | 6.54 |
| 44799.8125 | 6.63 |
| 44799.822916666664 | 6.55 |
| 44799.833333333336 | 6.3 |
| 44799.84375 | 6.22 |
| 44799.854166666664 | 6.42 |
| 44799.864583333336 | 6.58 |
| 44799.875 | 6.53 |
| 44799.885416666664 | 6.51 |
| 44799.895833333336 | 6.54 |
| 44799.90625 | 6.55 |
| 44799.916666666664 | 6.64 |
| 44799.927083333336 | 6.72 |
| 44799.9375 | 6.9 |
| 44799.947916666664 | 6.96 |
| 44799.958333333336 | 7.06 |
| 44799.96875 | 6.89 |
| 44799.979166666664 | 6.93 |
| 44799.989583333336 | 6.88 |
| 44800.0 | 6.8 |
| 44800.010416666664 | 6.67 |
| 44800.020833333336 | 6.56 |
| 44800.03125 | 6.45 |
| 44800.041666666664 | 6.41 |
| 44800.052083333336 | 6.33 |
| 44800.0625 | 6.28 |
| 44800.072916666664 | 6.11 |
| 44800.083333333336 | 6.08 |
| 44800.09375 | 6.12 |
| 44800.104166666664 | 6.18 |
| 44800.114583333336 | 6.14 |
| 44800.125 | 6.02 |
| 44800.135416666664 | 5.98 |
| 44800.145833333336 | 5.82 |
| 44800.15625 | 5.63 |
| 44800.166666666664 | 5.67 |
| 44800.177083333336 | 5.63 |
| 44800.1875 | 5.41 |
| 44800.197916666664 | 5.13 |
| 44800.208333333336 | 5.09 |
| 44800.21875 | 5.02 |
| 44800.229166666664 | 4.93 |
| 44800.239583333336 | 4.9 |
| 44800.25 | 4.85 |
| 44800.260416666664 | 4.93 |
| 44800.270833333336 | 4.86 |
| 44800.28125 | 4.84 |
| 44800.291666666664 | 4.83 |
| 44800.302083333336 | 4.74 |
| 44800.3125 | 4.63 |
| 44800.322916666664 | 4.39 |
| 44800.333333333336 | 4.36 |
| 44800.34375 | 4.34 |
| 44800.354166666664 | 4.43 |
| 44800.364583333336 | 4.4 |
| 44800.375 | 4.37 |
| 44800.385416666664 | 4.37 |
| 44800.395833333336 | 4.38 |
| 44800.40625 | 4.38 |
| 44800.416666666664 | 4.36 |
| 44800.427083333336 | 4.34 |
| 44800.4375 | 4.32 |
| 44800.447916666664 | 4.31 |
| 44800.458333333336 | 4.31 |
| 44800.46875 | 4.3 |
| 44800.479166666664 | 4.34 |
| 44800.489583333336 | 4.32 |
| 44800.5 | 4.35 |
| 44800.510416666664 | 4.38 |
| 44800.520833333336 | 4.42 |
| 44800.53125 | 4.44 |
| 44800.541666666664 | 5.11 |
| 44800.552083333336 | 4.56 |
| 44800.5625 | 4.56 |
| 44800.572916666664 | 4.63 |
| 44800.583333333336 | 4.69 |
| 44800.59375 | 4.53 |
| 44800.604166666664 | 4.79 |
| 44800.614583333336 | 4.82 |
| 44800.625 | 4.79 |
| 44800.635416666664 | 4.73 |
| 44800.645833333336 | 4.84 |
| 44800.65625 | 4.93 |
| 44800.666666666664 | 4.8 |
| 44800.677083333336 | 4.97 |
| 44800.6875 | 4.88 |
| 44800.697916666664 | 5.05 |
| 44800.708333333336 | 5.13 |
| 44800.71875 | 5.3 |
| 44800.729166666664 | 5.49 |
| 44800.739583333336 | 5.72 |
| 44800.75 | 5.84 |
| 44800.760416666664 | 6.17 |
| 44800.770833333336 | 6.25 |
| 44800.78125 | 6.3 |
| 44800.791666666664 | 6.49 |
| 44800.802083333336 | 6.51 |
| 44800.8125 | 6.41 |
| 44800.822916666664 | 5.91 |
| 44800.833333333336 | 6.1 |
| 44800.84375 | 6.03 |
| 44800.854166666664 | 6.13 |
| 44800.864583333336 | 6.19 |
| 44800.875 | 6.2 |
| 44800.885416666664 | 6.29 |
| 44800.895833333336 | 6.83 |
| 44800.90625 | 6.15 |
| 44800.916666666664 | 6.17 |
| 44800.927083333336 | 6.28 |
| 44800.9375 | 6.31 |
| 44800.947916666664 | 6.41 |
| 44800.958333333336 | 6.59 |
| 44800.96875 | 6.57 |
| 44800.979166666664 | 6.72 |
| 44800.989583333336 | 6.87 |
| 44801.0 | 6.78 |
| 44801.010416666664 | 6.62 |
| 44801.020833333336 | 6.43 |
| 44801.03125 | 6.26 |
| 44801.041666666664 | 6.17 |
| 44801.052083333336 | 6.05 |
| 44801.0625 | 6.03 |
| 44801.072916666664 | 5.91 |
| 44801.083333333336 | 5.86 |
| 44801.09375 | 5.78 |
| 44801.104166666664 | 5.78 |
| 44801.114583333336 | 5.83 |
| 44801.125 | 5.84 |
| 44801.135416666664 | 5.81 |
| 44801.145833333336 | 5.73 |
| 44801.15625 | 5.55 |
| 44801.166666666664 | 5.54 |
| 44801.177083333336 | 5.33 |
| 44801.1875 | 5.05 |
| 44801.197916666664 | 4.9 |
| 44801.208333333336 | 4.82 |
| 44801.21875 | 4.81 |
| 44801.229166666664 | 4.76 |
| 44801.239583333336 | 4.72 |
| 44801.25 | 4.58 |
| 44801.260416666664 | 4.44 |
| 44801.270833333336 | 4.41 |
| 44801.28125 | 4.3 |
| 44801.291666666664 | 4.28 |
| 44801.302083333336 | 4.29 |
| 44801.3125 | 4.22 |
| 44801.322916666664 | 4.1 |
| 44801.333333333336 | 4 |
| 44801.34375 | 4.13 |
| 44801.354166666664 | 3.97 |
| 44801.364583333336 | 3.99 |
| 44801.375 | 4.02 |
| 44801.385416666664 | 3.96 |
| 44801.395833333336 | 3.93 |
| 44801.40625 | 4.02 |
| 44801.416666666664 | 4.07 |
| 44801.427083333336 | 4.09 |
| 44801.4375 | 4.06 |
| 44801.447916666664 | 4 |
| 44801.458333333336 | 4.03 |
| 44801.46875 | 4.02 |
| 44801.479166666664 | 4.05 |
| 44801.489583333336 | 4.07 |
| 44801.5 | 4.1 |
| 44801.510416666664 | 4.14 |
| 44801.520833333336 | 4.16 |
| 44801.53125 | 4.2 |
| 44801.541666666664 | 4.26 |
| 44801.552083333336 | 4.27 |
| 44801.5625 | 4.29 |
| 44801.572916666664 | 4.34 |
| 44801.583333333336 | 4.49 |
| 44801.59375 | 4.49 |
| 44801.604166666664 | 4.52 |
| 44801.614583333336 | 4.52 |
| 44801.625 | 4.65 |
| 44801.635416666664 | 4.7 |
| 44801.645833333336 | 4.78 |
| 44801.65625 | 4.69 |
| 44801.666666666664 | 4.66 |
| 44801.677083333336 | 4.66 |
| 44801.6875 | 4.65 |
| 44801.697916666664 | 4.82 |
| 44801.708333333336 | 4.93 |
| 44801.71875 | 5.07 |
| 44801.729166666664 | 5.13 |
| 44801.739583333336 | 5.21 |
| 44801.75 | 5.34 |
| 44801.760416666664 | 5.47 |
| 44801.770833333336 | 5.59 |
| 44801.78125 | 5.78 |
| 44801.791666666664 | 5.85 |
| 44801.802083333336 | 5.95 |
| 44801.8125 | 6.16 |
| 44801.822916666664 | 6.18 |
| 44801.833333333336 | 6.71 |
| 44801.84375 | 6.63 |
| 44801.854166666664 | 6.62 |
| 44801.864583333336 | 6.32 |
| 44801.875 | 6.52 |
| 44801.885416666664 | 6.73 |
| 44801.895833333336 | 6.47 |
| 44801.90625 | 6.45 |
| 44801.916666666664 | 6.47 |
| 44801.927083333336 | 6.45 |
| 44801.9375 | 6.63 |
| 44801.947916666664 | 6.62 |
| 44801.958333333336 | 6.68 |
| 44801.96875 | 6.8 |
| 44801.979166666664 | 6.97 |
| 44801.989583333336 | 7.05 |
| 44802.0 | 7.13 |
| 44802.010416666664 | 7.22 |
| 44802.020833333336 | 7.22 |
| 44802.03125 | 7.17 |
| 44802.041666666664 | 7.02 |
| 44802.052083333336 | 6.84 |
| 44802.0625 | 6.66 |
| 44802.072916666664 | 6.5 |
| 44802.083333333336 | 6.37 |
| 44802.09375 | 6.26 |
| 44802.104166666664 | 6.13 |
| 44802.114583333336 | 5.78 |
| 44802.125 | 5.88 |
| 44802.135416666664 | 6.04 |
| 44802.145833333336 | 6 |
| 44802.15625 | 5.97 |
| 44802.166666666664 | 5.92 |
| 44802.177083333336 | 5.85 |
| 44802.1875 | 5.87 |
| 44802.197916666664 | 5.67 |
| 44802.208333333336 | 5.39 |
| 44802.21875 | 5.35 |
| 44802.229166666664 | 4.92 |
| 44802.239583333336 | 5.26 |
| 44802.25 | 5.16 |
| 44802.260416666664 | 4.95 |
| 44802.270833333336 | 4.85 |
| 44802.28125 | 4.79 |
| 44802.291666666664 | 4.69 |
| 44802.302083333336 | 4.58 |
| 44802.3125 | 4.47 |
| 44802.322916666664 | 4.42 |
| 44802.333333333336 | 4.33 |
| 44802.34375 | 4.24 |
| 44802.354166666664 | 4.01 |
| 44802.364583333336 | 4.16 |
| 44802.375 | 4 |
| 44802.385416666664 | 4.05 |
| 44802.395833333336 | 4.02 |
| 44802.40625 | 4.02 |
| 44802.416666666664 | 3.96 |
| 44802.427083333336 | 4 |
| 44802.4375 | 4.09 |
| 44802.447916666664 | 4.13 |
| 44802.458333333336 | 4.11 |
| 44802.46875 | 4.06 |
| 44802.479166666664 | 4.05 |
| 44802.489583333336 | 4.03 |
| 44802.5 | 4.02 |
| 44802.510416666664 | 4.08 |
| 44802.520833333336 | 4.12 |
| 44802.53125 | 4.17 |
| 44802.541666666664 | 4.21 |
| 44802.552083333336 | 4.27 |
| 44802.5625 | 4.3 |
| 44802.572916666664 | 4.32 |
| 44802.583333333336 | 4.34 |
| 44802.59375 | 4.38 |
| 44802.604166666664 | 4.5 |
| 44802.614583333336 | 4.6 |
| 44802.625 | 4.68 |
| 44802.635416666664 | 4.71 |
| 44802.645833333336 | 4.85 |
| 44802.65625 | 4.86 |
| 44802.666666666664 | 4.87 |
| 44802.677083333336 | 4.9 |
| 44802.6875 | 4.9 |
| 44802.697916666664 | 4.86 |
| 44802.708333333336 | 4.83 |
| 44802.71875 | 4.94 |
| 44802.729166666664 | 5.01 |
| 44802.739583333336 | 5.08 |
| 44802.75 | 5.16 |
| 44802.760416666664 | 5.31 |
| 44802.770833333336 | 5.37 |
| 44802.78125 | 5.46 |
| 44802.791666666664 | 5.59 |
| 44802.802083333336 | 5.76 |
| 44802.8125 | 5.87 |
| 44802.822916666664 | 5.91 |
| 44802.833333333336 | 6.06 |
| 44802.84375 | 6.11 |
| 44802.854166666664 | 6.4 |
| 44802.864583333336 | 6.62 |
| 44802.875 | 6.79 |
| 44802.885416666664 | 6.44 |
| 44802.895833333336 | 6.29 |
| 44802.90625 | 6.53 |
| 44802.916666666664 | 6.33 |
| 44802.927083333336 | 6.16 |
| 44802.9375 | 6.11 |
| 44802.947916666664 | 6.1 |
| 44802.958333333336 | 6.02 |
| 44802.96875 | 6.01 |
| 44802.979166666664 | 6.06 |
| 44802.989583333336 | 6.11 |
| 44803.0 | 6.19 |
| 44803.010416666664 | 6.3 |
| 44803.020833333336 | 6.45 |
| 44803.03125 | 6.33 |
| 44803.041666666664 | 6.31 |
| 44803.052083333336 | 6.33 |
| 44803.0625 | 6.27 |
| 44803.072916666664 | 6.24 |
| 44803.083333333336 | 6.13 |
| 44803.09375 | 6.02 |
| 44803.104166666664 | 5.96 |
| 44803.114583333336 | 5.97 |
| 44803.125 | 5.89 |
| 44803.135416666664 | 5.84 |
| 44803.145833333336 | 5.45 |
| 44803.15625 | 5.5 |
| 44803.166666666664 | 5.77 |
| 44803.177083333336 | 5.83 |
| 44803.1875 | 5.69 |
| 44803.197916666664 | 5.6 |
| 44803.208333333336 | 5.43 |
| 44803.21875 | 5.15 |
| 44803.229166666664 | 5.18 |
| 44803.239583333336 | 4.91 |
| 44803.25 | 4.71 |
| 44803.260416666664 | 4.78 |
| 44803.270833333336 | 4.48 |
| 44803.28125 | 4.63 |
| 44803.291666666664 | 4.42 |
| 44803.302083333336 | 4.31 |
| 44803.3125 | 4.23 |
| 44803.322916666664 | 4.1 |
| 44803.333333333336 | 4.03 |
| 44803.34375 | 4.07 |
| 44803.354166666664 | 3.95 |
| 44803.364583333336 | 3.84 |
| 44803.375 | 3.85 |
| 44803.385416666664 | 3.81 |
| 44803.395833333336 | 3.92 |
| 44803.40625 | 3.66 |
| 44803.416666666664 | 3.68 |
| 44803.427083333336 | 3.71 |
| 44803.4375 | 3.74 |
| 44803.447916666664 | 3.69 |
| 44803.458333333336 | 3.69 |
| 44803.46875 | 3.78 |
| 44803.479166666664 | 3.86 |
| 44803.489583333336 | 3.85 |
| 44803.5 | 3.83 |
| 44803.510416666664 | 3.8 |
| 44803.520833333336 | 3.8 |
| 44803.53125 | 3.81 |
| 44803.541666666664 | 3.81 |
| 44803.552083333336 | 3.85 |
| 44803.5625 | 3.9 |
| 44803.572916666664 | 3.96 |
| 44803.583333333336 | 4.04 |
| 44803.59375 | 4.21 |
| 44803.604166666664 | 4.31 |
| 44803.614583333336 | 4.49 |
| 44803.625 | 4.58 |
| 44803.635416666664 | 4.68 |
| 44803.645833333336 | 4.78 |
| 44803.65625 | 4.83 |
| 44803.666666666664 | 4.89 |
| 44803.677083333336 | 4.85 |
| 44803.6875 | 5.14 |
| 44803.697916666664 | 5.13 |
| 44803.708333333336 | 5.2 |
| 44803.71875 | 5.19 |
| 44803.729166666664 | 5.17 |
| 44803.739583333336 | 5.2 |
| 44803.75 | 5.3 |
| 44803.760416666664 | 5.36 |
| 44803.770833333336 | 5.45 |
| 44803.78125 | 5.44 |
| 44803.791666666664 | 5.5 |
| 44803.802083333336 | 5.57 |
| 44803.8125 | 5.68 |
| 44803.822916666664 | 5.8 |
| 44803.833333333336 | 5.9 |
| 44803.84375 | 6.03 |
| 44803.854166666664 | 6.16 |
| 44803.864583333336 | 6.18 |
| 44803.875 | 6.27 |
| 44803.885416666664 | 6.33 |
| 44803.895833333336 | 6.39 |
| 44803.90625 | 6.05 |
| 44803.916666666664 | 5.84 |
| 44803.927083333336 | 5.72 |
| 44803.9375 | 5.73 |
| 44803.947916666664 | 5.55 |
| 44803.958333333336 | 5.46 |
| 44803.96875 | 5.41 |
| 44803.979166666664 | 5.39 |
| 44803.989583333336 | 5.29 |
| 44804.0 | 5.26 |
| 44804.010416666664 | 5.23 |
| 44804.020833333336 | 5.22 |
| 44804.03125 | 5.25 |
| 44804.041666666664 | 5.24 |
| 44804.052083333336 | 5.27 |
| 44804.0625 | 5.28 |
| 44804.072916666664 | 5.32 |
| 44804.083333333336 | 5.33 |
| 44804.09375 | 5.4 |
| 44804.104166666664 | 5.44 |
| 44804.114583333336 | 5.53 |
| 44804.125 | 5.58 |
| 44804.135416666664 | 5.62 |
| 44804.145833333336 | 5.71 |
| 44804.15625 | 5.59 |
| 44804.166666666664 | 4.98 |
| 44804.177083333336 | 4.93 |
| 44804.1875 | 5.12 |
| 44804.197916666664 | 5 |
| 44804.208333333336 | 5.16 |
| 44804.21875 | 4.7 |
| 44804.229166666664 | 4.46 |
| 44804.239583333336 | 4.25 |
| 44804.25 | 4.22 |
| 44804.260416666664 | 4.04 |
| 44804.270833333336 | 4 |
| 44804.28125 | 4.21 |
| 44804.291666666664 | 4.09 |
| 44804.302083333336 | 4.02 |
| 44804.3125 | 3.9 |
| 44804.322916666664 | 3.88 |
| 44804.333333333336 | 3.98 |
| 44804.34375 | 3.89 |
| 44804.354166666664 | 3.85 |
| 44804.364583333336 | 3.9 |
| 44804.375 | 3.86 |
| 44804.385416666664 | 3.76 |
| 44804.395833333336 | 3.73 |
| 44804.40625 | 3.6 |
| 44804.416666666664 | 3.71 |
| 44804.427083333336 | 3.61 |
| 44804.4375 | 3.46 |
| 44804.447916666664 | 3.46 |
| 44804.458333333336 | 3.52 |
| 44804.46875 | 3.44 |
| 44804.479166666664 | 3.43 |
| 44804.489583333336 | 3.48 |
| 44804.5 | 3.59 |
| 44804.510416666664 | 3.65 |
| 44804.520833333336 | 3.62 |
| 44804.53125 | 3.61 |
| 44804.541666666664 | 3.64 |
| 44804.552083333336 | 3.67 |
| 44804.5625 | 3.73 |
| 44804.572916666664 | 3.8 |
| 44804.583333333336 | 3.9 |
| 44804.59375 | 4.05 |
| 44804.604166666664 | 4.3 |
| 44804.614583333336 | 4.48 |
| 44804.625 | 4.64 |
| 44804.635416666664 | 4.76 |
| 44804.645833333336 | 4.88 |
| 44804.65625 | 5 |
| 44804.666666666664 | 5.1 |
| 44804.677083333336 | 5.07 |
| 44804.6875 | 5.07 |
| 44804.697916666664 | 5.04 |
| 44804.708333333336 | 5.25 |
| 44804.71875 | 5.38 |
| 44804.729166666664 | 5.36 |
| 44804.739583333336 | 5.38 |
| 44804.75 | 5.47 |
| 44804.760416666664 | 5.45 |
| 44804.770833333336 | 5.47 |
| 44804.78125 | 5.44 |
| 44804.791666666664 | 5.42 |
| 44804.802083333336 | 5.72 |
| 44804.8125 | 5.72 |
| 44804.822916666664 | 5.7 |
| 44804.833333333336 | 5.73 |
| 44804.84375 | 5.99 |
| 44804.854166666664 | 6.12 |
| 44804.864583333336 | 6.08 |
| 44804.875 | 6.09 |
| 44804.885416666664 | 6.14 |
| 44804.895833333336 | 6.12 |
| 44804.90625 | 6.27 |
| 44804.916666666664 | 5.99 |
| 44804.927083333336 | 6.55 |
| 44804.9375 | 5.73 |
| 44804.947916666664 | 5.84 |
| 44804.958333333336 | 5.7 |
| 44804.96875 | 5.92 |
| 44804.979166666664 | 5.85 |
| 44804.989583333336 | 5.77 |
| 44805.0 | 5.75 |
| 44805.010416666664 | 5.7 |
| 44805.020833333336 | 5.73 |
| 44805.03125 | 5.68 |
| 44805.041666666664 | 5.69 |
| 44805.052083333336 | 5.63 |
| 44805.0625 | 5.54 |
| 44805.072916666664 | 5.47 |
| 44805.083333333336 | 5.44 |
| 44805.09375 | 5.4 |
| 44805.104166666664 | 5.42 |
| 44805.114583333336 | 5.36 |
| 44805.125 | 5.41 |
| 44805.135416666664 | 5.45 |
| 44805.145833333336 | 5.47 |